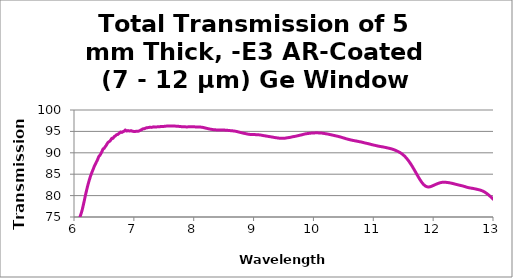
| Category | Transmission (%) |
|---|---|
| 1.66628 | 0.658 |
| 1.6743299999999999 | 0.65 |
| 1.6823800000000002 | 0.646 |
| 1.69043 | 0.589 |
| 1.69848 | 0.588 |
| 1.7065299999999999 | 0.595 |
| 1.71458 | 0.579 |
| 1.72263 | 0.606 |
| 1.73068 | 0.609 |
| 1.73873 | 0.575 |
| 1.74678 | 0.505 |
| 1.75483 | 0.498 |
| 1.76288 | 0.537 |
| 1.7709300000000001 | 0.599 |
| 1.77898 | 0.761 |
| 1.78703 | 1.16 |
| 1.79508 | 1.996 |
| 1.8031199999999998 | 3.977 |
| 1.8111700000000002 | 6.055 |
| 1.81922 | 8.681 |
| 1.82727 | 11.94 |
| 1.8353199999999998 | 15.665 |
| 1.84337 | 19.622 |
| 1.85142 | 23.466 |
| 1.85947 | 26.837 |
| 1.86752 | 30.071 |
| 1.87557 | 33.018 |
| 1.8836199999999999 | 35.954 |
| 1.89167 | 38.478 |
| 1.89972 | 40.631 |
| 1.90777 | 42.293 |
| 1.9158199999999999 | 44.439 |
| 1.92387 | 46.936 |
| 1.93192 | 49.769 |
| 1.93997 | 53.137 |
| 1.94802 | 57.067 |
| 1.95607 | 62.382 |
| 1.9641199999999999 | 65.169 |
| 1.97217 | 67.321 |
| 1.98022 | 69.548 |
| 1.98827 | 71.518 |
| 1.9963199999999999 | 73.368 |
| 2.0043699999999998 | 75.114 |
| 2.01242 | 76.716 |
| 2.02047 | 78.049 |
| 2.02852 | 79.151 |
| 2.0365699999999998 | 79.884 |
| 2.04461 | 80.293 |
| 2.05266 | 80.37 |
| 2.06071 | 80.096 |
| 2.06876 | 79.518 |
| 2.07681 | 78.684 |
| 2.08486 | 77.671 |
| 2.09291 | 76.513 |
| 2.10096 | 75.215 |
| 2.10901 | 73.944 |
| 2.11706 | 72.727 |
| 2.1251100000000003 | 71.654 |
| 2.1331599999999997 | 70.663 |
| 2.14121 | 69.829 |
| 2.1492600000000004 | 69.18 |
| 2.15731 | 68.738 |
| 2.16536 | 68.475 |
| 2.17341 | 68.414 |
| 2.18146 | 68.583 |
| 2.1895100000000003 | 68.929 |
| 2.1975599999999997 | 69.496 |
| 2.20561 | 70.258 |
| 2.21366 | 71.26 |
| 2.22171 | 72.481 |
| 2.22976 | 73.856 |
| 2.23781 | 75.408 |
| 2.24586 | 77.131 |
| 2.25391 | 78.988 |
| 2.26196 | 80.934 |
| 2.27001 | 82.915 |
| 2.27806 | 84.902 |
| 2.2861 | 86.828 |
| 2.29415 | 88.563 |
| 2.3022 | 90.094 |
| 2.31025 | 91.253 |
| 2.3183000000000002 | 92.045 |
| 2.3263499999999997 | 92.364 |
| 2.3344 | 92.126 |
| 2.34245 | 91.33 |
| 2.3505 | 89.987 |
| 2.35855 | 88.146 |
| 2.3666 | 85.846 |
| 2.37465 | 83.124 |
| 2.3827 | 80.14 |
| 2.39075 | 76.886 |
| 2.3988 | 73.564 |
| 2.40685 | 70.169 |
| 2.4149000000000003 | 66.825 |
| 2.4229499999999997 | 63.512 |
| 2.431 | 60.345 |
| 2.4390500000000004 | 57.309 |
| 2.4471 | 54.477 |
| 2.45515 | 51.805 |
| 2.4631999999999996 | 49.302 |
| 2.47125 | 47.005 |
| 2.4793000000000003 | 44.836 |
| 2.4873499999999997 | 42.894 |
| 2.4954 | 41.102 |
| 2.50345 | 39.467 |
| 2.5115 | 37.927 |
| 2.51955 | 36.567 |
| 2.52759 | 35.356 |
| 2.53564 | 34.273 |
| 2.5436900000000002 | 33.28 |
| 2.5517399999999997 | 32.388 |
| 2.55979 | 31.689 |
| 2.5678400000000003 | 30.796 |
| 2.57589 | 30.195 |
| 2.58394 | 29.778 |
| 2.5919899999999996 | 29.205 |
| 2.60004 | 28.619 |
| 2.6080900000000002 | 28.308 |
| 2.6161399999999997 | 28.233 |
| 2.62419 | 27.74 |
| 2.63224 | 27.703 |
| 2.64029 | 27.488 |
| 2.64834 | 27.345 |
| 2.65639 | 27.394 |
| 2.66444 | 27.706 |
| 2.67249 | 27.529 |
| 2.68054 | 27.548 |
| 2.68859 | 27.738 |
| 2.69664 | 27.957 |
| 2.7046900000000003 | 28.108 |
| 2.7127399999999997 | 28.271 |
| 2.72079 | 28.958 |
| 2.72884 | 28.891 |
| 2.73689 | 29.344 |
| 2.74494 | 29.513 |
| 2.7529899999999996 | 29.973 |
| 2.76104 | 30.071 |
| 2.7690799999999998 | 30.322 |
| 2.77713 | 30.382 |
| 2.78518 | 30.59 |
| 2.79323 | 30.683 |
| 2.80128 | 31.109 |
| 2.80933 | 31.248 |
| 2.81738 | 31.672 |
| 2.82543 | 32.006 |
| 2.83348 | 32.647 |
| 2.84153 | 33.092 |
| 2.84958 | 33.749 |
| 2.85763 | 34.327 |
| 2.86568 | 35.088 |
| 2.87373 | 35.856 |
| 2.88178 | 36.666 |
| 2.88983 | 37.544 |
| 2.8978800000000002 | 38.526 |
| 2.9059299999999997 | 39.461 |
| 2.91398 | 40.37 |
| 2.9220300000000003 | 41.501 |
| 2.93008 | 42.518 |
| 2.93813 | 43.617 |
| 2.94618 | 44.714 |
| 2.95423 | 45.944 |
| 2.9622800000000002 | 47.108 |
| 2.97033 | 48.25 |
| 2.97838 | 49.477 |
| 2.98643 | 50.64 |
| 2.99448 | 51.769 |
| 3.00252 | 52.893 |
| 3.01057 | 53.906 |
| 3.01862 | 54.88 |
| 3.02667 | 55.681 |
| 3.0347199999999996 | 56.483 |
| 3.04277 | 57.182 |
| 3.0508200000000003 | 57.784 |
| 3.0588699999999998 | 58.205 |
| 3.06692 | 58.664 |
| 3.07497 | 58.983 |
| 3.08302 | 59.234 |
| 3.09107 | 59.47 |
| 3.09912 | 59.665 |
| 3.10717 | 59.808 |
| 3.11522 | 59.896 |
| 3.1232699999999998 | 59.915 |
| 3.13132 | 59.898 |
| 3.13937 | 59.812 |
| 3.14742 | 59.691 |
| 3.1554699999999998 | 59.538 |
| 3.16352 | 59.362 |
| 3.17157 | 59.11 |
| 3.17962 | 58.896 |
| 3.1876700000000002 | 58.624 |
| 3.1957199999999997 | 58.375 |
| 3.20377 | 58.076 |
| 3.2118200000000003 | 57.737 |
| 3.21987 | 57.438 |
| 3.22792 | 57.137 |
| 3.23597 | 56.825 |
| 3.2440100000000003 | 56.518 |
| 3.2520599999999997 | 56.23 |
| 3.26011 | 55.989 |
| 3.26816 | 55.747 |
| 3.27621 | 55.492 |
| 3.28426 | 55.253 |
| 3.29231 | 55.057 |
| 3.30036 | 54.882 |
| 3.30841 | 54.745 |
| 3.31646 | 54.61 |
| 3.32451 | 54.527 |
| 3.33256 | 54.48 |
| 3.3406100000000003 | 54.414 |
| 3.3486599999999997 | 54.368 |
| 3.35671 | 54.334 |
| 3.3647600000000004 | 54.426 |
| 3.37281 | 54.529 |
| 3.38086 | 54.624 |
| 3.3889099999999996 | 54.739 |
| 3.39696 | 54.85 |
| 3.4050100000000003 | 55.043 |
| 3.4130599999999998 | 55.233 |
| 3.42111 | 55.479 |
| 3.42916 | 55.738 |
| 3.43721 | 56.039 |
| 3.44526 | 56.364 |
| 3.45331 | 56.681 |
| 3.46136 | 57.033 |
| 3.46941 | 57.389 |
| 3.47746 | 57.744 |
| 3.4855 | 58.14 |
| 3.4935500000000004 | 58.573 |
| 3.5016 | 59.01 |
| 3.50965 | 59.484 |
| 3.5176999999999996 | 59.995 |
| 3.52575 | 60.501 |
| 3.5338000000000003 | 61.047 |
| 3.5418499999999997 | 61.591 |
| 3.5499 | 62.133 |
| 3.55795 | 62.682 |
| 3.566 | 63.255 |
| 3.57405 | 63.832 |
| 3.5821 | 64.431 |
| 3.59015 | 65.041 |
| 3.5982 | 65.667 |
| 3.60625 | 66.271 |
| 3.6143 | 66.888 |
| 3.62235 | 67.497 |
| 3.6304000000000003 | 68.078 |
| 3.6384499999999997 | 68.634 |
| 3.6465 | 69.203 |
| 3.65455 | 69.758 |
| 3.6626 | 70.3 |
| 3.67065 | 70.819 |
| 3.6786999999999996 | 71.322 |
| 3.68675 | 71.817 |
| 3.6948000000000003 | 72.288 |
| 3.7028499999999998 | 72.722 |
| 3.7109 | 73.115 |
| 3.71895 | 73.472 |
| 3.72699 | 73.79 |
| 3.73504 | 74.048 |
| 3.74309 | 74.282 |
| 3.75114 | 74.488 |
| 3.7591900000000003 | 74.64 |
| 3.7672399999999997 | 74.749 |
| 3.77529 | 74.828 |
| 3.78334 | 74.862 |
| 3.79139 | 74.852 |
| 3.79944 | 74.792 |
| 3.8074899999999996 | 74.688 |
| 3.81554 | 74.522 |
| 3.8235900000000003 | 74.32 |
| 3.8316399999999997 | 74.062 |
| 3.83969 | 73.757 |
| 3.84774 | 73.413 |
| 3.85579 | 73.025 |
| 3.86384 | 72.616 |
| 3.87189 | 72.178 |
| 3.87994 | 71.695 |
| 3.88799 | 71.183 |
| 3.89604 | 70.653 |
| 3.90409 | 70.092 |
| 3.91214 | 69.495 |
| 3.92019 | 68.878 |
| 3.9282399999999997 | 68.227 |
| 3.93629 | 67.55 |
| 3.94434 | 66.852 |
| 3.95239 | 66.143 |
| 3.96044 | 65.422 |
| 3.96848 | 64.698 |
| 3.9765300000000003 | 63.971 |
| 3.98458 | 63.242 |
| 3.99263 | 62.513 |
| 4.00068 | 61.783 |
| 4.00873 | 61.05 |
| 4.01678 | 60.32 |
| 4.02483 | 59.579 |
| 4.0328800000000005 | 58.848 |
| 4.0409299999999995 | 58.119 |
| 4.04898 | 57.382 |
| 4.05703 | 56.65 |
| 4.06508 | 55.924 |
| 4.07313 | 55.201 |
| 4.08118 | 54.494 |
| 4.08923 | 53.797 |
| 4.09728 | 53.119 |
| 4.10533 | 52.463 |
| 4.11338 | 51.814 |
| 4.12143 | 51.181 |
| 4.129479999999999 | 50.56 |
| 4.13753 | 49.956 |
| 4.14558 | 49.361 |
| 4.15363 | 48.766 |
| 4.1616800000000005 | 48.19 |
| 4.1697299999999995 | 47.624 |
| 4.177779999999999 | 47.074 |
| 4.18583 | 46.538 |
| 4.19388 | 46.056 |
| 4.20192 | 45.62 |
| 4.20997 | 45.192 |
| 4.21802 | 44.771 |
| 4.22607 | 44.401 |
| 4.23412 | 43.969 |
| 4.24217 | 43.413 |
| 4.2502200000000006 | 42.786 |
| 4.25827 | 42.394 |
| 4.2663199999999994 | 42.126 |
| 4.27437 | 41.673 |
| 4.28242 | 41.292 |
| 4.29047 | 40.922 |
| 4.298520000000001 | 40.501 |
| 4.30657 | 40.106 |
| 4.31462 | 39.731 |
| 4.3226700000000005 | 39.384 |
| 4.33072 | 39.035 |
| 4.33877 | 38.707 |
| 4.34682 | 38.402 |
| 4.35487 | 38.106 |
| 4.36292 | 37.824 |
| 4.370970000000001 | 37.56 |
| 4.379020000000001 | 37.312 |
| 4.38707 | 37.079 |
| 4.3951199999999995 | 36.849 |
| 4.40317 | 36.626 |
| 4.41122 | 36.417 |
| 4.41927 | 36.209 |
| 4.42732 | 36.008 |
| 4.43537 | 35.815 |
| 4.44341 | 35.625 |
| 4.45146 | 35.444 |
| 4.45951 | 35.267 |
| 4.467560000000001 | 35.092 |
| 4.47561 | 34.932 |
| 4.4836599999999995 | 34.782 |
| 4.49171 | 34.635 |
| 4.49976 | 34.495 |
| 4.50781 | 34.365 |
| 4.51586 | 34.242 |
| 4.52391 | 34.13 |
| 4.53196 | 34.03 |
| 4.5400100000000005 | 33.937 |
| 4.54806 | 33.853 |
| 4.556109999999999 | 33.774 |
| 4.56416 | 33.696 |
| 4.57221 | 33.622 |
| 4.58026 | 33.559 |
| 4.588310000000001 | 33.495 |
| 4.59636 | 33.436 |
| 4.60441 | 33.381 |
| 4.6124600000000004 | 33.331 |
| 4.62051 | 33.286 |
| 4.62856 | 33.246 |
| 4.636609999999999 | 33.21 |
| 4.64466 | 33.177 |
| 4.65271 | 33.149 |
| 4.66076 | 33.131 |
| 4.668810000000001 | 33.12 |
| 4.67686 | 33.117 |
| 4.6849 | 33.12 |
| 4.69295 | 33.127 |
| 4.701 | 33.141 |
| 4.70905 | 33.16 |
| 4.7171 | 33.185 |
| 4.725149999999999 | 33.218 |
| 4.7332 | 33.251 |
| 4.74125 | 33.284 |
| 4.7493 | 33.326 |
| 4.757350000000001 | 33.371 |
| 4.7654 | 33.415 |
| 4.7734499999999995 | 33.464 |
| 4.7815 | 33.516 |
| 4.78955 | 33.571 |
| 4.7976 | 33.63 |
| 4.80565 | 33.693 |
| 4.8137 | 33.76 |
| 4.82175 | 33.835 |
| 4.8298000000000005 | 33.912 |
| 4.83785 | 33.994 |
| 4.845899999999999 | 34.078 |
| 4.85395 | 34.171 |
| 4.862 | 34.269 |
| 4.87005 | 34.374 |
| 4.878100000000001 | 34.486 |
| 4.88615 | 34.601 |
| 4.8942 | 34.717 |
| 4.90225 | 34.835 |
| 4.9103 | 34.961 |
| 4.91835 | 35.086 |
| 4.9263900000000005 | 35.211 |
| 4.9344399999999995 | 35.345 |
| 4.942489999999999 | 35.49 |
| 4.95054 | 35.632 |
| 4.95859 | 35.767 |
| 4.96664 | 35.906 |
| 4.97469 | 36.057 |
| 4.98274 | 36.208 |
| 4.99079 | 36.357 |
| 4.99884 | 36.516 |
| 5.00689 | 36.676 |
| 5.014939999999999 | 36.844 |
| 5.02299 | 37.005 |
| 5.03104 | 37.17 |
| 5.03909 | 37.351 |
| 5.047140000000001 | 37.536 |
| 5.05519 | 37.724 |
| 5.0632399999999995 | 37.919 |
| 5.07129 | 38.121 |
| 5.07934 | 38.327 |
| 5.08739 | 38.522 |
| 5.09544 | 38.728 |
| 5.10349 | 38.948 |
| 5.11154 | 39.163 |
| 5.1195900000000005 | 39.382 |
| 5.12764 | 39.608 |
| 5.135689999999999 | 39.839 |
| 5.14374 | 40.067 |
| 5.15179 | 40.282 |
| 5.15984 | 40.506 |
| 5.16788 | 40.749 |
| 5.17593 | 40.988 |
| 5.183979999999999 | 41.226 |
| 5.19203 | 41.474 |
| 5.20008 | 41.727 |
| 5.20813 | 41.974 |
| 5.2161800000000005 | 42.223 |
| 5.2242299999999995 | 42.476 |
| 5.232279999999999 | 42.746 |
| 5.24033 | 43.01 |
| 5.24838 | 43.274 |
| 5.25643 | 43.556 |
| 5.26448 | 43.841 |
| 5.27253 | 44.13 |
| 5.28058 | 44.42 |
| 5.28863 | 44.711 |
| 5.29668 | 45.003 |
| 5.304729999999999 | 45.299 |
| 5.31278 | 45.601 |
| 5.32083 | 45.904 |
| 5.32888 | 46.211 |
| 5.336930000000001 | 46.524 |
| 5.34498 | 46.851 |
| 5.3530299999999995 | 47.161 |
| 5.36108 | 47.446 |
| 5.36913 | 47.759 |
| 5.37718 | 48.085 |
| 5.38523 | 48.406 |
| 5.39328 | 48.729 |
| 5.40133 | 49.055 |
| 5.40937 | 49.39 |
| 5.41742 | 49.731 |
| 5.425470000000001 | 50.049 |
| 5.433520000000001 | 50.362 |
| 5.44157 | 50.705 |
| 5.4496199999999995 | 51.055 |
| 5.45767 | 51.41 |
| 5.46572 | 51.768 |
| 5.47377 | 52.107 |
| 5.48182 | 52.452 |
| 5.48987 | 52.807 |
| 5.49792 | 53.176 |
| 5.5059700000000005 | 53.548 |
| 5.51402 | 53.916 |
| 5.522069999999999 | 54.286 |
| 5.53012 | 54.646 |
| 5.53817 | 55.014 |
| 5.54622 | 55.404 |
| 5.554270000000001 | 55.79 |
| 5.56232 | 56.157 |
| 5.57037 | 56.53 |
| 5.57842 | 56.914 |
| 5.58647 | 57.276 |
| 5.59452 | 57.641 |
| 5.60257 | 58.032 |
| 5.61062 | 58.417 |
| 5.61867 | 58.793 |
| 5.626720000000001 | 59.169 |
| 5.6347700000000005 | 59.564 |
| 5.642810000000001 | 59.969 |
| 5.65086 | 60.324 |
| 5.65891 | 60.676 |
| 5.66696 | 61.052 |
| 5.67501 | 61.446 |
| 5.68306 | 61.824 |
| 5.69111 | 62.197 |
| 5.69916 | 62.582 |
| 5.70721 | 62.988 |
| 5.71526 | 63.397 |
| 5.723310000000001 | 63.759 |
| 5.73136 | 64.116 |
| 5.7394099999999995 | 64.494 |
| 5.74746 | 64.874 |
| 5.75551 | 65.253 |
| 5.76356 | 65.654 |
| 5.77161 | 66.026 |
| 5.77966 | 66.346 |
| 5.78771 | 66.689 |
| 5.7957600000000005 | 67.055 |
| 5.80381 | 67.421 |
| 5.811859999999999 | 67.795 |
| 5.81991 | 68.195 |
| 5.82796 | 68.506 |
| 5.83601 | 68.741 |
| 5.844060000000001 | 69.026 |
| 5.85211 | 69.35 |
| 5.86016 | 69.664 |
| 5.86821 | 69.946 |
| 5.87626 | 70.238 |
| 5.8843000000000005 | 70.538 |
| 5.89235 | 70.771 |
| 5.900399999999999 | 70.97 |
| 5.90845 | 71.219 |
| 5.9165 | 71.515 |
| 5.92455 | 71.823 |
| 5.932600000000001 | 72.114 |
| 5.94065 | 72.277 |
| 5.9487 | 72.37 |
| 5.95675 | 72.542 |
| 5.9648 | 72.738 |
| 5.97285 | 72.897 |
| 5.980899999999999 | 73.031 |
| 5.98895 | 73.113 |
| 5.997 | 73.144 |
| 6.00505 | 73.227 |
| 6.0131000000000006 | 73.318 |
| 6.02115 | 73.369 |
| 6.0291999999999994 | 73.463 |
| 6.03725 | 73.644 |
| 6.0453 | 73.811 |
| 6.05335 | 73.861 |
| 6.0614 | 73.962 |
| 6.06945 | 74.15 |
| 6.0775 | 74.309 |
| 6.0855500000000005 | 74.489 |
| 6.0936 | 74.747 |
| 6.101649999999999 | 75.066 |
| 6.1097 | 75.424 |
| 6.11775 | 75.774 |
| 6.12579 | 76.114 |
| 6.13384 | 76.505 |
| 6.14189 | 76.957 |
| 6.14994 | 77.44 |
| 6.15799 | 77.948 |
| 6.16604 | 78.458 |
| 6.1740900000000005 | 78.946 |
| 6.18214 | 79.482 |
| 6.190189999999999 | 80.039 |
| 6.19824 | 80.526 |
| 6.20629 | 80.99 |
| 6.21434 | 81.471 |
| 6.222390000000001 | 81.938 |
| 6.23044 | 82.377 |
| 6.23849 | 82.798 |
| 6.2465399999999995 | 83.201 |
| 6.25459 | 83.585 |
| 6.26264 | 83.958 |
| 6.270689999999999 | 84.315 |
| 6.27874 | 84.649 |
| 6.28679 | 84.965 |
| 6.29484 | 85.268 |
| 6.3028900000000005 | 85.558 |
| 6.3109399999999996 | 85.837 |
| 6.318989999999999 | 86.112 |
| 6.32704 | 86.395 |
| 6.33509 | 86.691 |
| 6.34314 | 86.961 |
| 6.35119 | 87.184 |
| 6.35924 | 87.408 |
| 6.36728 | 87.658 |
| 6.37533 | 87.89 |
| 6.38338 | 88.103 |
| 6.391430000000001 | 88.335 |
| 6.39948 | 88.604 |
| 6.4075299999999995 | 88.904 |
| 6.41558 | 89.144 |
| 6.42363 | 89.263 |
| 6.43168 | 89.398 |
| 6.43973 | 89.581 |
| 6.44778 | 89.776 |
| 6.45583 | 89.978 |
| 6.4638800000000005 | 90.204 |
| 6.47193 | 90.466 |
| 6.479979999999999 | 90.746 |
| 6.48803 | 90.93 |
| 6.49608 | 90.967 |
| 6.50413 | 91.05 |
| 6.51218 | 91.221 |
| 6.52023 | 91.397 |
| 6.52828 | 91.542 |
| 6.5363299999999995 | 91.703 |
| 6.54438 | 91.895 |
| 6.55243 | 92.088 |
| 6.560479999999999 | 92.262 |
| 6.56853 | 92.408 |
| 6.57658 | 92.514 |
| 6.58463 | 92.594 |
| 6.5926800000000005 | 92.67 |
| 6.6007299999999995 | 92.758 |
| 6.608770000000001 | 92.886 |
| 6.61682 | 93.068 |
| 6.62487 | 93.27 |
| 6.63292 | 93.39 |
| 6.64097 | 93.356 |
| 6.64902 | 93.366 |
| 6.65707 | 93.497 |
| 6.66512 | 93.667 |
| 6.67317 | 93.797 |
| 6.681220000000001 | 93.85 |
| 6.6892700000000005 | 93.905 |
| 6.6973199999999995 | 94.022 |
| 6.70537 | 94.162 |
| 6.71342 | 94.241 |
| 6.72147 | 94.257 |
| 6.729520000000001 | 94.284 |
| 6.73757 | 94.359 |
| 6.74562 | 94.455 |
| 6.7536700000000005 | 94.55 |
| 6.76172 | 94.646 |
| 6.76977 | 94.754 |
| 6.777819999999999 | 94.852 |
| 6.78587 | 94.853 |
| 6.79392 | 94.78 |
| 6.80197 | 94.767 |
| 6.810020000000001 | 94.837 |
| 6.81807 | 94.929 |
| 6.8261199999999995 | 94.988 |
| 6.83417 | 95.022 |
| 6.84222 | 95.099 |
| 6.8502600000000005 | 95.245 |
| 6.85831 | 95.336 |
| 6.866359999999999 | 95.213 |
| 6.87441 | 95.096 |
| 6.88246 | 95.08 |
| 6.89051 | 95.131 |
| 6.898560000000001 | 95.178 |
| 6.90661 | 95.18 |
| 6.91466 | 95.136 |
| 6.92271 | 95.094 |
| 6.93076 | 95.086 |
| 6.93881 | 95.11 |
| 6.94686 | 95.151 |
| 6.95491 | 95.169 |
| 6.96296 | 95.135 |
| 6.971010000000001 | 95.063 |
| 6.9790600000000005 | 95.024 |
| 6.9871099999999995 | 95.015 |
| 6.99516 | 94.994 |
| 7.00321 | 94.975 |
| 7.01126 | 94.97 |
| 7.019310000000001 | 94.979 |
| 7.02736 | 94.998 |
| 7.03541 | 95.029 |
| 7.04346 | 95.046 |
| 7.05151 | 95.027 |
| 7.05956 | 95.008 |
| 7.067609999999999 | 95.013 |
| 7.07566 | 95.046 |
| 7.083699999999999 | 95.088 |
| 7.09175 | 95.133 |
| 7.0998 | 95.189 |
| 7.10785 | 95.249 |
| 7.1159 | 95.306 |
| 7.12395 | 95.36 |
| 7.132 | 95.425 |
| 7.1400500000000005 | 95.503 |
| 7.1481 | 95.569 |
| 7.156149999999999 | 95.61 |
| 7.1642 | 95.624 |
| 7.17225 | 95.621 |
| 7.1803 | 95.648 |
| 7.188350000000001 | 95.708 |
| 7.1964 | 95.774 |
| 7.20445 | 95.825 |
| 7.2125 | 95.844 |
| 7.22055 | 95.846 |
| 7.2286 | 95.863 |
| 7.23665 | 95.884 |
| 7.2447 | 95.906 |
| 7.25275 | 95.926 |
| 7.260800000000001 | 95.95 |
| 7.2688500000000005 | 95.963 |
| 7.2768999999999995 | 95.958 |
| 7.28495 | 95.942 |
| 7.293 | 95.936 |
| 7.30105 | 95.957 |
| 7.3091 | 95.984 |
| 7.31715 | 96.017 |
| 7.325189999999999 | 96.049 |
| 7.33324 | 96.064 |
| 7.34129 | 96.043 |
| 7.34934 | 96.018 |
| 7.3573900000000005 | 96.003 |
| 7.3654399999999995 | 96.014 |
| 7.373489999999999 | 96.036 |
| 7.38154 | 96.05 |
| 7.38959 | 96.06 |
| 7.39764 | 96.065 |
| 7.40569 | 96.068 |
| 7.41374 | 96.068 |
| 7.42179 | 96.07 |
| 7.42984 | 96.078 |
| 7.43789 | 96.102 |
| 7.445939999999999 | 96.136 |
| 7.45399 | 96.163 |
| 7.46204 | 96.175 |
| 7.47009 | 96.154 |
| 7.478140000000001 | 96.135 |
| 7.48619 | 96.128 |
| 7.49424 | 96.139 |
| 7.50229 | 96.162 |
| 7.51034 | 96.182 |
| 7.51839 | 96.199 |
| 7.52644 | 96.212 |
| 7.53449 | 96.222 |
| 7.54254 | 96.234 |
| 7.550590000000001 | 96.248 |
| 7.5586400000000005 | 96.264 |
| 7.56668 | 96.276 |
| 7.57473 | 96.28 |
| 7.58278 | 96.278 |
| 7.5908299999999995 | 96.271 |
| 7.59888 | 96.267 |
| 7.60693 | 96.265 |
| 7.614979999999999 | 96.263 |
| 7.62303 | 96.26 |
| 7.63108 | 96.259 |
| 7.63913 | 96.259 |
| 7.6471800000000005 | 96.26 |
| 7.6552299999999995 | 96.259 |
| 7.663279999999999 | 96.256 |
| 7.67133 | 96.252 |
| 7.67938 | 96.247 |
| 7.68743 | 96.241 |
| 7.69548 | 96.234 |
| 7.70353 | 96.224 |
| 7.71158 | 96.213 |
| 7.71963 | 96.202 |
| 7.72768 | 96.194 |
| 7.735729999999999 | 96.188 |
| 7.74378 | 96.181 |
| 7.75183 | 96.173 |
| 7.75988 | 96.16 |
| 7.767930000000001 | 96.147 |
| 7.77598 | 96.134 |
| 7.78403 | 96.123 |
| 7.79208 | 96.113 |
| 7.80013 | 96.103 |
| 7.8081700000000005 | 96.092 |
| 7.81622 | 96.081 |
| 7.82427 | 96.072 |
| 7.832319999999999 | 96.067 |
| 7.84037 | 96.067 |
| 7.84842 | 96.066 |
| 7.85647 | 96.065 |
| 7.864520000000001 | 96.058 |
| 7.87257 | 96.052 |
| 7.8806199999999995 | 96.047 |
| 7.88867 | 96.048 |
| 7.89672 | 96.053 |
| 7.90477 | 96.062 |
| 7.91282 | 96.073 |
| 7.92087 | 96.082 |
| 7.92892 | 96.089 |
| 7.9369700000000005 | 96.09 |
| 7.94502 | 96.09 |
| 7.953069999999999 | 96.09 |
| 7.96112 | 96.09 |
| 7.96917 | 96.09 |
| 7.97722 | 96.09 |
| 7.985270000000001 | 96.087 |
| 7.99332 | 96.082 |
| 8.00137 | 96.074 |
| 8.00942 | 96.066 |
| 8.01747 | 96.059 |
| 8.02552 | 96.054 |
| 8.03357 | 96.052 |
| 8.04162 | 96.051 |
| 8.04966 | 96.051 |
| 8.05771 | 96.05 |
| 8.065760000000001 | 96.049 |
| 8.07381 | 96.046 |
| 8.081859999999999 | 96.042 |
| 8.08991 | 96.036 |
| 8.09796 | 96.028 |
| 8.10601 | 96.018 |
| 8.11406 | 96.008 |
| 8.12211 | 95.996 |
| 8.13016 | 95.982 |
| 8.13821 | 95.966 |
| 8.14626 | 95.947 |
| 8.15431 | 95.926 |
| 8.16236 | 95.902 |
| 8.17041 | 95.875 |
| 8.17846 | 95.847 |
| 8.18651 | 95.819 |
| 8.19456 | 95.79 |
| 8.20261 | 95.762 |
| 8.21066 | 95.736 |
| 8.21871 | 95.709 |
| 8.22676 | 95.684 |
| 8.23481 | 95.658 |
| 8.24286 | 95.631 |
| 8.25091 | 95.604 |
| 8.258959999999998 | 95.578 |
| 8.26701 | 95.555 |
| 8.27506 | 95.532 |
| 8.28311 | 95.512 |
| 8.29115 | 95.491 |
| 8.2992 | 95.471 |
| 8.30725 | 95.451 |
| 8.315299999999999 | 95.434 |
| 8.32335 | 95.419 |
| 8.3314 | 95.407 |
| 8.339450000000001 | 95.396 |
| 8.3475 | 95.385 |
| 8.35555 | 95.374 |
| 8.3636 | 95.364 |
| 8.371649999999999 | 95.357 |
| 8.379700000000001 | 95.351 |
| 8.38775 | 95.346 |
| 8.3958 | 95.34 |
| 8.40385 | 95.335 |
| 8.4119 | 95.331 |
| 8.41995 | 95.328 |
| 8.428 | 95.327 |
| 8.43605 | 95.327 |
| 8.4441 | 95.328 |
| 8.45215 | 95.328 |
| 8.4602 | 95.328 |
| 8.46825 | 95.326 |
| 8.476299999999998 | 95.324 |
| 8.484350000000001 | 95.321 |
| 8.4924 | 95.317 |
| 8.50045 | 95.312 |
| 8.5085 | 95.306 |
| 8.516549999999999 | 95.3 |
| 8.52459 | 95.294 |
| 8.532639999999999 | 95.287 |
| 8.54069 | 95.281 |
| 8.54874 | 95.272 |
| 8.556790000000001 | 95.263 |
| 8.56484 | 95.251 |
| 8.57289 | 95.239 |
| 8.58094 | 95.226 |
| 8.588989999999999 | 95.213 |
| 8.597040000000002 | 95.2 |
| 8.60509 | 95.188 |
| 8.61314 | 95.177 |
| 8.62119 | 95.168 |
| 8.62924 | 95.158 |
| 8.63729 | 95.148 |
| 8.645340000000001 | 95.137 |
| 8.65339 | 95.124 |
| 8.66144 | 95.11 |
| 8.66949 | 95.094 |
| 8.67754 | 95.079 |
| 8.68559 | 95.064 |
| 8.69364 | 95.046 |
| 8.701690000000001 | 95.028 |
| 8.70974 | 95.004 |
| 8.71779 | 94.979 |
| 8.72584 | 94.949 |
| 8.733889999999999 | 94.919 |
| 8.741940000000001 | 94.888 |
| 8.74999 | 94.858 |
| 8.758040000000001 | 94.829 |
| 8.76608 | 94.802 |
| 8.77413 | 94.775 |
| 8.78218 | 94.748 |
| 8.79023 | 94.722 |
| 8.79828 | 94.694 |
| 8.806329999999999 | 94.666 |
| 8.81438 | 94.639 |
| 8.82243 | 94.612 |
| 8.83048 | 94.586 |
| 8.83853 | 94.561 |
| 8.84658 | 94.538 |
| 8.854629999999998 | 94.515 |
| 8.862680000000001 | 94.492 |
| 8.87073 | 94.467 |
| 8.87878 | 94.441 |
| 8.88683 | 94.414 |
| 8.894879999999999 | 94.388 |
| 8.90293 | 94.367 |
| 8.91098 | 94.347 |
| 8.919030000000001 | 94.332 |
| 8.92708 | 94.318 |
| 8.93513 | 94.305 |
| 8.94318 | 94.292 |
| 8.951229999999999 | 94.28 |
| 8.959280000000001 | 94.27 |
| 8.96733 | 94.262 |
| 8.97538 | 94.257 |
| 8.98343 | 94.256 |
| 8.99148 | 94.256 |
| 8.99953 | 94.258 |
| 9.00757 | 94.258 |
| 9.01562 | 94.257 |
| 9.02367 | 94.251 |
| 9.03172 | 94.244 |
| 9.03977 | 94.234 |
| 9.04782 | 94.224 |
| 9.05587 | 94.215 |
| 9.06392 | 94.206 |
| 9.071969999999999 | 94.202 |
| 9.080020000000001 | 94.198 |
| 9.08807 | 94.192 |
| 9.09612 | 94.186 |
| 9.10417 | 94.174 |
| 9.112219999999999 | 94.161 |
| 9.12027 | 94.142 |
| 9.12832 | 94.121 |
| 9.136370000000001 | 94.098 |
| 9.14442 | 94.074 |
| 9.15247 | 94.053 |
| 9.16052 | 94.032 |
| 9.168569999999999 | 94.013 |
| 9.176620000000002 | 93.995 |
| 9.18467 | 93.977 |
| 9.19272 | 93.96 |
| 9.20077 | 93.94 |
| 9.20882 | 93.921 |
| 9.21687 | 93.9 |
| 9.224920000000001 | 93.88 |
| 9.23297 | 93.859 |
| 9.24102 | 93.839 |
| 9.24906 | 93.82 |
| 9.25711 | 93.801 |
| 9.26516 | 93.783 |
| 9.273209999999999 | 93.765 |
| 9.28126 | 93.746 |
| 9.289309999999999 | 93.728 |
| 9.297360000000001 | 93.71 |
| 9.30541 | 93.691 |
| 9.31346 | 93.672 |
| 9.32151 | 93.651 |
| 9.329559999999999 | 93.63 |
| 9.33761 | 93.608 |
| 9.34566 | 93.588 |
| 9.35371 | 93.568 |
| 9.36176 | 93.55 |
| 9.36981 | 93.534 |
| 9.37786 | 93.518 |
| 9.385909999999999 | 93.501 |
| 9.39396 | 93.484 |
| 9.40201 | 93.467 |
| 9.41006 | 93.45 |
| 9.41811 | 93.436 |
| 9.42616 | 93.423 |
| 9.434209999999998 | 93.413 |
| 9.442260000000001 | 93.405 |
| 9.45031 | 93.397 |
| 9.45836 | 93.39 |
| 9.46641 | 93.384 |
| 9.474459999999999 | 93.378 |
| 9.48251 | 93.374 |
| 9.490549999999999 | 93.373 |
| 9.4986 | 93.374 |
| 9.50665 | 93.382 |
| 9.514700000000001 | 93.391 |
| 9.52275 | 93.409 |
| 9.5308 | 93.427 |
| 9.53885 | 93.448 |
| 9.546899999999999 | 93.47 |
| 9.554950000000002 | 93.49 |
| 9.563 | 93.508 |
| 9.57105 | 93.524 |
| 9.5791 | 93.538 |
| 9.58715 | 93.552 |
| 9.5952 | 93.569 |
| 9.60325 | 93.586 |
| 9.6113 | 93.61 |
| 9.61935 | 93.635 |
| 9.6274 | 93.663 |
| 9.63545 | 93.691 |
| 9.6435 | 93.717 |
| 9.651549999999999 | 93.742 |
| 9.659600000000001 | 93.764 |
| 9.66765 | 93.785 |
| 9.6757 | 93.805 |
| 9.68375 | 93.824 |
| 9.691799999999999 | 93.843 |
| 9.69985 | 93.865 |
| 9.7079 | 93.887 |
| 9.715950000000001 | 93.912 |
| 9.724 | 93.938 |
| 9.732040000000001 | 93.965 |
| 9.74009 | 93.993 |
| 9.74814 | 94.021 |
| 9.75619 | 94.048 |
| 9.76424 | 94.074 |
| 9.772290000000002 | 94.099 |
| 9.78034 | 94.124 |
| 9.78839 | 94.149 |
| 9.79644 | 94.173 |
| 9.80449 | 94.199 |
| 9.81254 | 94.228 |
| 9.82059 | 94.257 |
| 9.82864 | 94.29 |
| 9.83669 | 94.322 |
| 9.84474 | 94.352 |
| 9.85279 | 94.38 |
| 9.86084 | 94.405 |
| 9.868889999999999 | 94.424 |
| 9.876940000000001 | 94.444 |
| 9.88499 | 94.459 |
| 9.893040000000001 | 94.475 |
| 9.90109 | 94.491 |
| 9.909139999999999 | 94.508 |
| 9.91719 | 94.526 |
| 9.92524 | 94.542 |
| 9.933290000000001 | 94.559 |
| 9.94134 | 94.571 |
| 9.94939 | 94.583 |
| 9.95744 | 94.594 |
| 9.96548 | 94.603 |
| 9.97353 | 94.612 |
| 9.98158 | 94.621 |
| 9.98963 | 94.63 |
| 9.99768 | 94.638 |
| 10.005700000000001 | 94.645 |
| 10.0138 | 94.651 |
| 10.021799999999999 | 94.654 |
| 10.0299 | 94.657 |
| 10.0379 | 94.657 |
| 10.046 | 94.657 |
| 10.054 | 94.658 |
| 10.062100000000001 | 94.657 |
| 10.0701 | 94.657 |
| 10.0782 | 94.656 |
| 10.086200000000002 | 94.655 |
| 10.094299999999999 | 94.652 |
| 10.1023 | 94.649 |
| 10.1104 | 94.645 |
| 10.1184 | 94.637 |
| 10.1265 | 94.629 |
| 10.1345 | 94.616 |
| 10.1426 | 94.602 |
| 10.1506 | 94.587 |
| 10.158700000000001 | 94.568 |
| 10.1667 | 94.549 |
| 10.1748 | 94.53 |
| 10.182799999999999 | 94.51 |
| 10.1909 | 94.491 |
| 10.1989 | 94.472 |
| 10.207 | 94.453 |
| 10.215 | 94.434 |
| 10.2231 | 94.415 |
| 10.2311 | 94.395 |
| 10.2392 | 94.374 |
| 10.247200000000001 | 94.354 |
| 10.2553 | 94.331 |
| 10.2633 | 94.307 |
| 10.2714 | 94.283 |
| 10.279399999999999 | 94.258 |
| 10.2875 | 94.232 |
| 10.2955 | 94.207 |
| 10.303600000000001 | 94.182 |
| 10.3116 | 94.156 |
| 10.319700000000001 | 94.131 |
| 10.3277 | 94.106 |
| 10.335799999999999 | 94.08 |
| 10.3438 | 94.053 |
| 10.351899999999999 | 94.026 |
| 10.3599 | 94 |
| 10.368 | 93.974 |
| 10.376 | 93.949 |
| 10.3841 | 93.925 |
| 10.392100000000001 | 93.901 |
| 10.4002 | 93.875 |
| 10.4082 | 93.85 |
| 10.4163 | 93.822 |
| 10.424299999999999 | 93.793 |
| 10.4324 | 93.764 |
| 10.4404 | 93.732 |
| 10.4485 | 93.701 |
| 10.4565 | 93.668 |
| 10.4646 | 93.636 |
| 10.4726 | 93.603 |
| 10.4807 | 93.569 |
| 10.488700000000001 | 93.535 |
| 10.496799999999999 | 93.501 |
| 10.5048 | 93.465 |
| 10.5129 | 93.429 |
| 10.5209 | 93.394 |
| 10.529 | 93.358 |
| 10.537 | 93.322 |
| 10.5451 | 93.289 |
| 10.5531 | 93.257 |
| 10.561200000000001 | 93.226 |
| 10.5692 | 93.196 |
| 10.5773 | 93.167 |
| 10.5853 | 93.138 |
| 10.593399999999999 | 93.109 |
| 10.6014 | 93.08 |
| 10.6095 | 93.052 |
| 10.6175 | 93.025 |
| 10.6256 | 92.997 |
| 10.6336 | 92.972 |
| 10.6417 | 92.947 |
| 10.649700000000001 | 92.922 |
| 10.6578 | 92.9 |
| 10.665799999999999 | 92.877 |
| 10.6739 | 92.855 |
| 10.681899999999999 | 92.835 |
| 10.69 | 92.814 |
| 10.698 | 92.794 |
| 10.706100000000001 | 92.774 |
| 10.7141 | 92.754 |
| 10.7222 | 92.731 |
| 10.7302 | 92.708 |
| 10.738299999999999 | 92.686 |
| 10.7463 | 92.663 |
| 10.7544 | 92.639 |
| 10.7624 | 92.618 |
| 10.7705 | 92.597 |
| 10.7785 | 92.576 |
| 10.7866 | 92.555 |
| 10.7946 | 92.533 |
| 10.802700000000002 | 92.512 |
| 10.8107 | 92.484 |
| 10.818700000000002 | 92.457 |
| 10.826799999999999 | 92.428 |
| 10.8348 | 92.397 |
| 10.8429 | 92.366 |
| 10.8509 | 92.336 |
| 10.859 | 92.308 |
| 10.867 | 92.28 |
| 10.8751 | 92.253 |
| 10.8831 | 92.229 |
| 10.891200000000001 | 92.205 |
| 10.8992 | 92.18 |
| 10.9073 | 92.156 |
| 10.915299999999998 | 92.132 |
| 10.923399999999999 | 92.104 |
| 10.9314 | 92.075 |
| 10.9395 | 92.047 |
| 10.9475 | 92.015 |
| 10.9556 | 91.984 |
| 10.9636 | 91.952 |
| 10.9717 | 91.923 |
| 10.979700000000001 | 91.894 |
| 10.9878 | 91.865 |
| 10.9958 | 91.84 |
| 11.0039 | 91.814 |
| 11.011899999999999 | 91.789 |
| 11.02 | 91.764 |
| 11.028 | 91.74 |
| 11.036100000000001 | 91.715 |
| 11.0441 | 91.689 |
| 11.052200000000001 | 91.662 |
| 11.0602 | 91.636 |
| 11.068299999999999 | 91.61 |
| 11.0763 | 91.584 |
| 11.0844 | 91.559 |
| 11.0924 | 91.536 |
| 11.1005 | 91.513 |
| 11.1085 | 91.492 |
| 11.1166 | 91.472 |
| 11.124600000000001 | 91.453 |
| 11.132700000000002 | 91.434 |
| 11.1407 | 91.416 |
| 11.1488 | 91.398 |
| 11.156799999999999 | 91.379 |
| 11.1649 | 91.359 |
| 11.1729 | 91.339 |
| 11.181 | 91.317 |
| 11.189 | 91.295 |
| 11.1971 | 91.272 |
| 11.2051 | 91.247 |
| 11.2132 | 91.222 |
| 11.221200000000001 | 91.196 |
| 11.229299999999999 | 91.169 |
| 11.2373 | 91.142 |
| 11.2454 | 91.115 |
| 11.2534 | 91.089 |
| 11.2615 | 91.062 |
| 11.2695 | 91.036 |
| 11.2776 | 91.009 |
| 11.2856 | 90.981 |
| 11.293700000000001 | 90.953 |
| 11.3017 | 90.922 |
| 11.3098 | 90.889 |
| 11.3178 | 90.856 |
| 11.325899999999999 | 90.819 |
| 11.3339 | 90.779 |
| 11.342 | 90.74 |
| 11.35 | 90.697 |
| 11.3581 | 90.652 |
| 11.366100000000001 | 90.606 |
| 11.3742 | 90.559 |
| 11.382200000000001 | 90.507 |
| 11.3903 | 90.456 |
| 11.398299999999999 | 90.404 |
| 11.4064 | 90.348 |
| 11.414399999999999 | 90.292 |
| 11.4225 | 90.236 |
| 11.4305 | 90.174 |
| 11.438600000000001 | 90.112 |
| 11.4466 | 90.049 |
| 11.4547 | 89.976 |
| 11.4627 | 89.903 |
| 11.470799999999999 | 89.83 |
| 11.4788 | 89.745 |
| 11.4869 | 89.658 |
| 11.4949 | 89.57 |
| 11.503 | 89.472 |
| 11.511 | 89.368 |
| 11.5191 | 89.265 |
| 11.5271 | 89.154 |
| 11.535200000000001 | 89.034 |
| 11.5432 | 88.914 |
| 11.5513 | 88.789 |
| 11.559299999999999 | 88.654 |
| 11.5674 | 88.518 |
| 11.5754 | 88.381 |
| 11.5835 | 88.23 |
| 11.5915 | 88.079 |
| 11.5996 | 87.929 |
| 11.6076 | 87.764 |
| 11.6157 | 87.597 |
| 11.623700000000001 | 87.431 |
| 11.6318 | 87.255 |
| 11.6398 | 87.074 |
| 11.6479 | 86.893 |
| 11.655899999999999 | 86.708 |
| 11.664 | 86.518 |
| 11.672 | 86.328 |
| 11.6801 | 86.138 |
| 11.6881 | 85.942 |
| 11.696200000000001 | 85.747 |
| 11.7042 | 85.552 |
| 11.712299999999999 | 85.354 |
| 11.7203 | 85.156 |
| 11.728399999999999 | 84.958 |
| 11.7364 | 84.762 |
| 11.7445 | 84.566 |
| 11.7525 | 84.37 |
| 11.7606 | 84.178 |
| 11.768600000000001 | 83.992 |
| 11.7767 | 83.806 |
| 11.7847 | 83.621 |
| 11.7928 | 83.455 |
| 11.800799999999999 | 83.29 |
| 11.8089 | 83.125 |
| 11.8169 | 82.979 |
| 11.825 | 82.844 |
| 11.833 | 82.709 |
| 11.8411 | 82.584 |
| 11.8491 | 82.485 |
| 11.8572 | 82.387 |
| 11.865200000000002 | 82.289 |
| 11.873299999999999 | 82.226 |
| 11.8813 | 82.167 |
| 11.8894 | 82.108 |
| 11.8974 | 82.069 |
| 11.9055 | 82.048 |
| 11.9135 | 82.028 |
| 11.9216 | 82.012 |
| 11.9296 | 82.026 |
| 11.937700000000001 | 82.041 |
| 11.9457 | 82.055 |
| 11.9538 | 82.087 |
| 11.961799999999998 | 82.127 |
| 11.969899999999999 | 82.166 |
| 11.9779 | 82.208 |
| 11.986 | 82.258 |
| 11.994 | 82.309 |
| 12.0021 | 82.359 |
| 12.0101 | 82.41 |
| 12.0181 | 82.461 |
| 12.026200000000001 | 82.511 |
| 12.0342 | 82.561 |
| 12.0423 | 82.609 |
| 12.0503 | 82.658 |
| 12.058399999999999 | 82.706 |
| 12.0664 | 82.75 |
| 12.0745 | 82.795 |
| 12.0825 | 82.839 |
| 12.0906 | 82.881 |
| 12.098600000000001 | 82.918 |
| 12.1067 | 82.956 |
| 12.114700000000001 | 82.994 |
| 12.1228 | 83.021 |
| 12.130799999999999 | 83.047 |
| 12.1389 | 83.073 |
| 12.1469 | 83.093 |
| 12.155 | 83.104 |
| 12.163 | 83.115 |
| 12.171100000000001 | 83.126 |
| 12.1791 | 83.125 |
| 12.1872 | 83.123 |
| 12.195200000000002 | 83.12 |
| 12.203299999999999 | 83.115 |
| 12.2113 | 83.103 |
| 12.2194 | 83.092 |
| 12.2274 | 83.08 |
| 12.2355 | 83.067 |
| 12.2435 | 83.052 |
| 12.2516 | 83.036 |
| 12.2596 | 83.021 |
| 12.267700000000001 | 83.002 |
| 12.2757 | 82.984 |
| 12.2838 | 82.965 |
| 12.291799999999999 | 82.943 |
| 12.2999 | 82.918 |
| 12.3079 | 82.893 |
| 12.316 | 82.868 |
| 12.324 | 82.84 |
| 12.3321 | 82.811 |
| 12.3401 | 82.782 |
| 12.3482 | 82.752 |
| 12.356200000000001 | 82.723 |
| 12.3643 | 82.694 |
| 12.3723 | 82.664 |
| 12.3804 | 82.635 |
| 12.388399999999999 | 82.606 |
| 12.3965 | 82.576 |
| 12.4045 | 82.547 |
| 12.412600000000001 | 82.519 |
| 12.4206 | 82.491 |
| 12.428700000000001 | 82.464 |
| 12.4367 | 82.437 |
| 12.444799999999999 | 82.412 |
| 12.4528 | 82.388 |
| 12.460899999999999 | 82.364 |
| 12.4689 | 82.338 |
| 12.477 | 82.312 |
| 12.485 | 82.285 |
| 12.4931 | 82.259 |
| 12.501100000000001 | 82.226 |
| 12.5092 | 82.192 |
| 12.5172 | 82.157 |
| 12.5253 | 82.123 |
| 12.533299999999999 | 82.086 |
| 12.5414 | 82.049 |
| 12.5494 | 82.012 |
| 12.5575 | 81.977 |
| 12.5655 | 81.947 |
| 12.5736 | 81.916 |
| 12.5816 | 81.886 |
| 12.5897 | 81.86 |
| 12.597700000000001 | 81.838 |
| 12.605799999999999 | 81.817 |
| 12.6138 | 81.795 |
| 12.6219 | 81.775 |
| 12.6299 | 81.756 |
| 12.638 | 81.737 |
| 12.646 | 81.718 |
| 12.6541 | 81.698 |
| 12.6621 | 81.678 |
| 12.670200000000001 | 81.657 |
| 12.6782 | 81.636 |
| 12.6863 | 81.613 |
| 12.6943 | 81.59 |
| 12.702399999999999 | 81.566 |
| 12.7104 | 81.543 |
| 12.7185 | 81.518 |
| 12.7265 | 81.492 |
| 12.7346 | 81.467 |
| 12.7426 | 81.442 |
| 12.7507 | 81.414 |
| 12.758700000000001 | 81.386 |
| 12.7668 | 81.358 |
| 12.774799999999999 | 81.328 |
| 12.7829 | 81.293 |
| 12.790899999999999 | 81.259 |
| 12.799 | 81.225 |
| 12.807 | 81.186 |
| 12.815100000000001 | 81.14 |
| 12.8231 | 81.095 |
| 12.8312 | 81.049 |
| 12.8392 | 80.995 |
| 12.847299999999999 | 80.932 |
| 12.8553 | 80.87 |
| 12.8634 | 80.807 |
| 12.8714 | 80.735 |
| 12.8795 | 80.655 |
| 12.8875 | 80.574 |
| 12.8956 | 80.494 |
| 12.9036 | 80.407 |
| 12.911700000000002 | 80.316 |
| 12.9197 | 80.224 |
| 12.9278 | 80.133 |
| 12.935799999999999 | 80.039 |
| 12.9439 | 79.942 |
| 12.9519 | 79.845 |
| 12.96 | 79.749 |
| 12.968 | 79.648 |
| 12.9761 | 79.544 |
| 12.9841 | 79.44 |
| 12.9922 | 79.337 |
| 13.000200000000001 | 79.229 |
| 13.008299999999998 | 79.118 |
| 13.0163 | 79.006 |
| 13.0244 | 78.895 |
| 13.032399999999999 | 78.782 |
| 13.0405 | 78.669 |
| 13.0485 | 78.555 |
| 13.0566 | 78.442 |
| 13.0646 | 78.329 |
| 13.072700000000001 | 78.218 |
| 13.0807 | 78.108 |
| 13.088799999999999 | 77.997 |
| 13.0968 | 77.887 |
| 13.104899999999999 | 77.777 |
| 13.1129 | 77.668 |
| 13.121 | 77.559 |
| 13.129 | 77.45 |
| 13.1371 | 77.34 |
| 13.145100000000001 | 77.231 |
| 13.1532 | 77.122 |
| 13.161200000000001 | 77.014 |
| 13.1693 | 76.91 |
| 13.177299999999999 | 76.806 |
| 13.1854 | 76.702 |
| 13.1934 | 76.598 |
| 13.2015 | 76.506 |
| 13.2095 | 76.416 |
| 13.2175 | 76.326 |
| 13.2256 | 76.236 |
| 13.233600000000001 | 76.157 |
| 13.241700000000002 | 76.084 |
| 13.2497 | 76.011 |
| 13.2578 | 75.937 |
| 13.265799999999999 | 75.87 |
| 13.2739 | 75.81 |
| 13.2819 | 75.749 |
| 13.29 | 75.689 |
| 13.298 | 75.63 |
| 13.3061 | 75.579 |
| 13.3141 | 75.527 |
| 13.3222 | 75.475 |
| 13.330200000000001 | 75.424 |
| 13.338299999999998 | 75.382 |
| 13.3463 | 75.341 |
| 13.3544 | 75.299 |
| 13.3624 | 75.258 |
| 13.3705 | 75.226 |
| 13.3785 | 75.198 |
| 13.3866 | 75.17 |
| 13.3946 | 75.142 |
| 13.402700000000001 | 75.121 |
| 13.4107 | 75.108 |
| 13.4188 | 75.096 |
| 13.4268 | 75.083 |
| 13.434899999999999 | 75.072 |
| 13.4429 | 75.07 |
| 13.451 | 75.069 |
| 13.459 | 75.067 |
| 13.4671 | 75.066 |
| 13.475100000000001 | 75.069 |
| 13.4832 | 75.073 |
| 13.491200000000001 | 75.078 |
| 13.4993 | 75.082 |
| 13.507299999999999 | 75.088 |
| 13.5154 | 75.097 |
| 13.523399999999999 | 75.106 |
| 13.5315 | 75.115 |
| 13.5395 | 75.124 |
| 13.547600000000001 | 75.138 |
| 13.5556 | 75.151 |
| 13.5637 | 75.165 |
| 13.5717 | 75.179 |
| 13.579799999999999 | 75.193 |
| 13.5878 | 75.208 |
| 13.5959 | 75.222 |
| 13.6039 | 75.237 |
| 13.612 | 75.251 |
| 13.62 | 75.262 |
| 13.6281 | 75.274 |
| 13.6361 | 75.285 |
| 13.644200000000001 | 75.296 |
| 13.6522 | 75.306 |
| 13.6603 | 75.315 |
| 13.668299999999999 | 75.324 |
| 13.6764 | 75.333 |
| 13.6844 | 75.341 |
| 13.6925 | 75.348 |
| 13.7005 | 75.355 |
| 13.7086 | 75.362 |
| 13.7166 | 75.368 |
| 13.7247 | 75.372 |
| 13.732700000000001 | 75.374 |
| 13.7408 | 75.376 |
| 13.7488 | 75.379 |
| 13.7569 | 75.38 |
| 13.764899999999999 | 75.38 |
| 13.773 | 75.38 |
| 13.781 | 75.38 |
| 13.789100000000001 | 75.379 |
| 13.7971 | 75.38 |
| 13.805200000000001 | 75.381 |
| 13.8132 | 75.381 |
| 13.821299999999999 | 75.382 |
| 13.8293 | 75.382 |
| 13.837399999999999 | 75.38 |
| 13.8454 | 75.378 |
| 13.8535 | 75.376 |
| 13.8615 | 75.374 |
| 13.8696 | 75.366 |
| 13.877600000000001 | 75.353 |
| 13.8857 | 75.34 |
| 13.8937 | 75.328 |
| 13.9018 | 75.315 |
| 13.909799999999999 | 75.294 |
| 13.9179 | 75.272 |
| 13.9259 | 75.25 |
| 13.934 | 75.229 |
| 13.942 | 75.206 |
| 13.9501 | 75.182 |
| 13.9581 | 75.157 |
| 13.9662 | 75.132 |
| 13.974200000000002 | 75.107 |
| 13.982299999999999 | 75.082 |
| 13.9903 | 75.056 |
| 13.9984 | 75.03 |
| 14.0064 | 75.004 |
| 14.0145 | 74.978 |
| 14.0225 | 74.952 |
| 14.0306 | 74.925 |
| 14.0386 | 74.899 |
| 14.046700000000001 | 74.872 |
| 14.0547 | 74.846 |
| 14.0628 | 74.819 |
| 14.070799999999998 | 74.793 |
| 14.078899999999999 | 74.766 |
| 14.0869 | 74.74 |
| 14.095 | 74.712 |
| 14.103 | 74.681 |
| 14.1111 | 74.651 |
| 14.1191 | 74.62 |
| 14.1272 | 74.59 |
| 14.135200000000001 | 74.552 |
| 14.1433 | 74.511 |
| 14.151299999999999 | 74.47 |
| 14.1594 | 74.429 |
| 14.167399999999999 | 74.389 |
| 14.1755 | 74.339 |
| 14.1835 | 74.288 |
| 14.191600000000001 | 74.238 |
| 14.1996 | 74.187 |
| 14.2077 | 74.136 |
| 14.2157 | 74.079 |
| 14.223799999999999 | 74.021 |
| 14.2318 | 73.964 |
| 14.2399 | 73.906 |
| 14.2479 | 73.846 |
| 14.256 | 73.777 |
| 14.264 | 73.708 |
| 14.2721 | 73.64 |
| 14.280100000000001 | 73.571 |
| 14.288200000000002 | 73.495 |
| 14.2962 | 73.409 |
| 14.3043 | 73.322 |
| 14.312299999999999 | 73.236 |
| 14.3204 | 73.15 |
| 14.3284 | 73.056 |
| 14.3365 | 72.955 |
| 14.3445 | 72.854 |
| 14.3526 | 72.753 |
| 14.3606 | 72.652 |
| 14.3687 | 72.546 |
| 14.376700000000001 | 72.436 |
| 14.384799999999998 | 72.325 |
| 14.3928 | 72.215 |
| 14.4009 | 72.105 |
| 14.4089 | 71.987 |
| 14.4169 | 71.865 |
| 14.425 | 71.742 |
| 14.433 | 71.62 |
| 14.4411 | 71.498 |
| 14.4491 | 71.364 |
| 14.4572 | 71.222 |
| 14.465200000000001 | 71.08 |
| 14.4733 | 70.938 |
| 14.4813 | 70.797 |
| 14.4894 | 70.642 |
| 14.497399999999999 | 70.48 |
| 14.5055 | 70.318 |
| 14.5135 | 70.156 |
| 14.521600000000001 | 69.994 |
| 14.5296 | 69.826 |
| 14.537700000000001 | 69.651 |
| 14.5457 | 69.477 |
| 14.553799999999999 | 69.304 |
| 14.5618 | 69.13 |
| 14.5699 | 68.955 |
| 14.5779 | 68.778 |
| 14.586 | 68.601 |
| 14.594 | 68.424 |
| 14.6021 | 68.248 |
| 14.610100000000001 | 68.072 |
| 14.6182 | 67.894 |
| 14.6262 | 67.717 |
| 14.6343 | 67.54 |
| 14.642299999999999 | 67.364 |
| 14.6504 | 67.187 |
| 14.6584 | 67.009 |
| 14.6665 | 66.831 |
| 14.6745 | 66.654 |
| 14.6826 | 66.477 |
| 14.6906 | 66.3 |
| 14.6987 | 66.123 |
| 14.706700000000001 | 65.947 |
| 14.714799999999999 | 65.771 |
| 14.7228 | 65.595 |
| 14.7309 | 65.419 |
| 14.7389 | 65.244 |
| 14.747 | 65.07 |
| 14.755 | 64.896 |
| 14.7631 | 64.721 |
| 14.7711 | 64.548 |
| 14.779200000000001 | 64.376 |
| 14.7872 | 64.206 |
| 14.7953 | 64.036 |
| 14.8033 | 63.866 |
| 14.811399999999999 | 63.696 |
| 14.8194 | 63.533 |
| 14.8275 | 63.378 |
| 14.8355 | 63.223 |
| 14.8436 | 63.069 |
| 14.851600000000001 | 62.914 |
| 14.8597 | 62.763 |
| 14.867700000000001 | 62.622 |
| 14.8758 | 62.481 |
| 14.883799999999999 | 62.34 |
| 14.8919 | 62.2 |
| 14.899899999999999 | 62.06 |
| 14.908 | 61.889 |
| 14.916 | 61.715 |
| 14.924100000000001 | 61.541 |
| 14.9321 | 61.368 |
| 14.9402 | 61.194 |
| 14.9482 | 60.994 |
| 14.956299999999999 | 60.772 |
| 14.9643 | 60.552 |
| 14.9724 | 60.331 |
| 14.9804 | 60.11 |
| 14.9885 | 59.898 |
| 14.9965 | 59.716 |
| 15.0046 | 59.535 |
| 15.0126 | 59.353 |
| 15.020700000000001 | 59.172 |
| 15.0287 | 58.992 |
| 15.0368 | 58.84 |
| 15.044799999999999 | 58.696 |
| 15.0529 | 58.553 |
| 15.0609 | 58.409 |
| 15.069 | 58.266 |
| 15.077 | 58.118 |
| 15.0851 | 57.963 |
| 15.0931 | 57.808 |
| 15.1012 | 57.654 |
| 15.109200000000001 | 57.499 |
| 15.117299999999998 | 57.345 |
| 15.1253 | 57.173 |
| 15.1334 | 57 |
| 15.141399999999999 | 56.826 |
| 15.1495 | 56.653 |
| 15.1575 | 56.48 |
| 15.1656 | 56.305 |
| 15.1736 | 56.126 |
| 15.181700000000001 | 55.948 |
| 15.1897 | 55.77 |
| 15.197799999999999 | 55.592 |
| 15.2058 | 55.414 |
| 15.213899999999999 | 55.239 |
| 15.2219 | 55.065 |
| 15.23 | 54.891 |
| 15.238 | 54.718 |
| 15.2461 | 54.544 |
| 15.254100000000001 | 54.375 |
| 15.2622 | 54.212 |
| 15.2702 | 54.049 |
| 15.2783 | 53.887 |
| 15.286299999999999 | 53.724 |
| 15.2944 | 53.562 |
| 15.3024 | 53.413 |
| 15.3105 | 53.268 |
| 15.3185 | 53.123 |
| 15.326600000000001 | 52.979 |
| 15.3346 | 52.834 |
| 15.3427 | 52.692 |
| 15.350700000000002 | 52.569 |
| 15.358799999999999 | 52.446 |
| 15.3668 | 52.323 |
| 15.3749 | 52.2 |
| 15.3829 | 52.077 |
| 15.391 | 51.965 |
| 15.399 | 51.864 |
| 15.4071 | 51.763 |
| 15.4151 | 51.663 |
| 15.423200000000001 | 51.562 |
| 15.4312 | 51.462 |
| 15.4393 | 51.377 |
| 15.447299999999998 | 51.296 |
| 15.4554 | 51.216 |
| 15.4634 | 51.136 |
| 15.4715 | 51.055 |
| 15.4795 | 50.976 |
| 15.4876 | 50.913 |
| 15.4956 | 50.849 |
| 15.5037 | 50.786 |
| 15.511700000000001 | 50.722 |
| 15.5198 | 50.659 |
| 15.5278 | 50.6 |
| 15.5359 | 50.551 |
| 15.543899999999999 | 50.503 |
| 15.552 | 50.454 |
| 15.56 | 50.406 |
| 15.568100000000001 | 50.358 |
| 15.5761 | 50.317 |
| 15.584200000000001 | 50.283 |
| 15.5922 | 50.25 |
| 15.600299999999999 | 50.216 |
| 15.6083 | 50.183 |
| 15.616299999999999 | 50.149 |
| 15.6244 | 50.125 |
| 15.6324 | 50.105 |
| 15.6405 | 50.084 |
| 15.6485 | 50.064 |
| 15.656600000000001 | 50.044 |
| 15.6646 | 50.024 |
| 15.6727 | 50.012 |
| 15.6807 | 50.002 |
| 15.688799999999999 | 49.992 |
| 15.6968 | 49.982 |
| 15.7049 | 49.972 |
| 15.7129 | 49.962 |
| 15.721 | 49.96 |
| 15.729 | 49.958 |
| 15.7371 | 49.956 |
| 15.7451 | 49.955 |
| 15.753200000000001 | 49.953 |
| 15.7612 | 49.951 |
| 15.7693 | 49.956 |
| 15.777299999999999 | 49.961 |
| 15.7854 | 49.966 |
| 15.7934 | 49.972 |
| 15.8015 | 49.977 |
| 15.8095 | 49.982 |
| 15.8176 | 49.992 |
| 15.8256 | 50.003 |
| 15.8337 | 50.013 |
| 15.841700000000001 | 50.024 |
| 15.8498 | 50.034 |
| 15.8578 | 50.044 |
| 15.8659 | 50.059 |
| 15.873899999999999 | 50.074 |
| 15.882 | 50.089 |
| 15.89 | 50.104 |
| 15.898100000000001 | 50.119 |
| 15.9061 | 50.134 |
| 15.914200000000001 | 50.153 |
| 15.9222 | 50.172 |
| 15.930299999999999 | 50.191 |
| 15.9383 | 50.21 |
| 15.946399999999999 | 50.23 |
| 15.9544 | 50.249 |
| 15.9625 | 50.271 |
| 15.9705 | 50.294 |
| 15.9786 | 50.317 |
| 15.986600000000001 | 50.34 |
| 15.9947 | 50.362 |
| 16.0027 | 50.385 |
| 16.0108 | 50.408 |
| 16.0188 | 50.43 |
| 16.0269 | 50.453 |
| 16.0349 | 50.476 |
| 16.043 | 50.498 |
| 16.051 | 50.521 |
| 16.0591 | 50.538 |
| 16.0671 | 50.554 |
| 16.075200000000002 | 50.568 |
| 16.0832 | 50.583 |
| 16.0913 | 50.598 |
| 16.0993 | 50.613 |
| 16.1074 | 50.623 |
| 16.1154 | 50.625 |
| 16.1235 | 50.627 |
| 16.1315 | 50.629 |
| 16.1396 | 50.631 |
| 16.1476 | 50.633 |
| 16.1557 | 50.632 |
| 16.163700000000002 | 50.62 |
| 16.171799999999998 | 50.608 |
| 16.1798 | 50.596 |
| 16.1879 | 50.584 |
| 16.195899999999998 | 50.572 |
| 16.204 | 50.56 |
| 16.212 | 50.534 |
| 16.2201 | 50.508 |
| 16.2281 | 50.481 |
| 16.2362 | 50.454 |
| 16.2442 | 50.427 |
| 16.252299999999998 | 50.4 |
| 16.2603 | 50.364 |
| 16.2684 | 50.322 |
| 16.2764 | 50.28 |
| 16.2845 | 50.238 |
| 16.2925 | 50.196 |
| 16.3006 | 50.154 |
| 16.308600000000002 | 50.109 |
| 16.3167 | 50.053 |
| 16.3247 | 49.997 |
| 16.3328 | 49.941 |
| 16.340799999999998 | 49.886 |
| 16.3489 | 49.83 |
| 16.3569 | 49.774 |
| 16.365 | 49.707 |
| 16.373 | 49.638 |
| 16.3811 | 49.569 |
| 16.3891 | 49.5 |
| 16.3972 | 49.432 |
| 16.4052 | 49.363 |
| 16.4133 | 49.288 |
| 16.4213 | 49.205 |
| 16.4294 | 49.122 |
| 16.4374 | 49.039 |
| 16.4455 | 48.956 |
| 16.4535 | 48.874 |
| 16.461599999999997 | 48.791 |
| 16.4696 | 48.692 |
| 16.477700000000002 | 48.592 |
| 16.4857 | 48.492 |
| 16.4938 | 48.392 |
| 16.5018 | 48.292 |
| 16.509900000000002 | 48.193 |
| 16.5179 | 48.082 |
| 16.526 | 47.96 |
| 16.534 | 47.838 |
| 16.542099999999998 | 47.716 |
| 16.550099999999997 | 47.594 |
| 16.5582 | 47.472 |
| 16.566200000000002 | 47.35 |
| 16.5743 | 47.2 |
| 16.5823 | 47.046 |
| 16.590400000000002 | 46.893 |
| 16.5984 | 46.74 |
| 16.6065 | 46.587 |
| 16.6145 | 46.434 |
| 16.6226 | 46.269 |
| 16.630599999999998 | 46.076 |
| 16.6387 | 45.883 |
| 16.6467 | 45.691 |
| 16.654799999999998 | 45.499 |
| 16.6628 | 45.306 |
| 16.670900000000003 | 45.114 |
| 16.678900000000002 | 44.898 |
| 16.687 | 44.67 |
| 16.695 | 44.442 |
| 16.7031 | 44.214 |
| 16.7111 | 43.986 |
| 16.7192 | 43.759 |
| 16.7272 | 43.532 |
| 16.7353 | 43.279 |
| 16.743299999999998 | 43.025 |
| 16.7514 | 42.772 |
| 16.759400000000003 | 42.519 |
| 16.7675 | 42.267 |
| 16.7755 | 42.014 |
| 16.7836 | 41.756 |
| 16.7916 | 41.482 |
| 16.7997 | 41.208 |
| 16.8077 | 40.934 |
| 16.8157 | 40.66 |
| 16.8238 | 40.386 |
| 16.831799999999998 | 40.113 |
| 16.8399 | 39.83 |
| 16.847900000000003 | 39.537 |
| 16.856 | 39.244 |
| 16.864 | 38.951 |
| 16.8721 | 38.659 |
| 16.8801 | 38.367 |
| 16.8882 | 38.075 |
| 16.8962 | 37.778 |
| 16.9043 | 37.48 |
| 16.9123 | 37.182 |
| 16.9204 | 36.883 |
| 16.9284 | 36.586 |
| 16.9365 | 36.288 |
| 16.9445 | 35.991 |
| 16.952599999999997 | 35.698 |
| 16.9606 | 35.408 |
| 16.968700000000002 | 35.117 |
| 16.9767 | 34.826 |
| 16.9848 | 34.536 |
| 16.9928 | 34.246 |
| 17.0009 | 33.957 |
| 17.0089 | 33.672 |
| 17.017 | 33.389 |
| 17.025 | 33.106 |
| 17.033099999999997 | 32.823 |
| 17.0411 | 32.54 |
| 17.0492 | 32.257 |
| 17.0572 | 31.975 |
| 17.0653 | 31.697 |
| 17.0733 | 31.42 |
| 17.081400000000002 | 31.142 |
| 17.0894 | 30.865 |
| 17.0975 | 30.588 |
| 17.1055 | 30.311 |
| 17.113599999999998 | 30.035 |
| 17.121599999999997 | 29.765 |
| 17.1297 | 29.495 |
| 17.137700000000002 | 29.226 |
| 17.145799999999998 | 28.957 |
| 17.1538 | 28.688 |
| 17.161900000000003 | 28.419 |
| 17.169900000000002 | 28.151 |
| 17.178 | 27.887 |
| 17.186 | 27.624 |
| 17.1941 | 27.361 |
| 17.202099999999998 | 27.098 |
| 17.2102 | 26.836 |
| 17.2182 | 26.574 |
| 17.2263 | 26.312 |
| 17.234299999999998 | 26.053 |
| 17.2424 | 25.794 |
| 17.250400000000003 | 25.536 |
| 17.2585 | 25.278 |
| 17.2665 | 25.02 |
| 17.2746 | 24.762 |
| 17.2826 | 24.505 |
| 17.2907 | 24.248 |
| 17.2987 | 23.992 |
| 17.3068 | 23.735 |
| 17.314799999999998 | 23.479 |
| 17.3229 | 23.224 |
| 17.3309 | 22.968 |
| 17.339 | 22.713 |
| 17.347 | 22.462 |
| 17.3551 | 22.215 |
| 17.3631 | 21.969 |
| 17.3712 | 21.722 |
| 17.3792 | 21.476 |
| 17.3873 | 21.23 |
| 17.3953 | 20.985 |
| 17.4034 | 20.747 |
| 17.4114 | 20.526 |
| 17.4195 | 20.305 |
| 17.4275 | 20.085 |
| 17.435599999999997 | 19.864 |
| 17.4436 | 19.644 |
| 17.451700000000002 | 19.425 |
| 17.4597 | 19.206 |
| 17.4678 | 19.014 |
| 17.4758 | 18.821 |
| 17.483900000000002 | 18.629 |
| 17.4919 | 18.438 |
| 17.5 | 18.246 |
| 17.508 | 18.054 |
| 17.516099999999998 | 17.863 |
| 17.524099999999997 | 17.689 |
| 17.5322 | 17.523 |
| 17.540200000000002 | 17.357 |
| 17.548299999999998 | 17.191 |
| 17.5563 | 17.025 |
| 17.564400000000003 | 16.86 |
| 17.572400000000002 | 16.694 |
| 17.5805 | 16.539 |
| 17.5885 | 16.405 |
| 17.5966 | 16.271 |
| 17.604599999999998 | 16.137 |
| 17.6127 | 16.003 |
| 17.6207 | 15.869 |
| 17.6288 | 15.736 |
| 17.6368 | 15.602 |
| 17.6449 | 15.499 |
| 17.652900000000002 | 15.4 |
| 17.661 | 15.301 |
| 17.669 | 15.201 |
| 17.6771 | 15.102 |
| 17.6851 | 15.003 |
| 17.6932 | 14.904 |
| 17.7012 | 14.816 |
| 17.7093 | 14.744 |
| 17.717299999999998 | 14.671 |
| 17.7254 | 14.599 |
| 17.733400000000003 | 14.526 |
| 17.7415 | 14.454 |
| 17.7495 | 14.382 |
| 17.7576 | 14.31 |
| 17.7656 | 14.255 |
| 17.7737 | 14.202 |
| 17.7817 | 14.149 |
| 17.7898 | 14.097 |
| 17.7978 | 14.044 |
| 17.8059 | 13.991 |
| 17.8139 | 13.939 |
| 17.822 | 13.892 |
| 17.83 | 13.859 |
| 17.838099999999997 | 13.826 |
| 17.8461 | 13.793 |
| 17.854200000000002 | 13.76 |
| 17.8622 | 13.727 |
| 17.8703 | 13.694 |
| 17.8783 | 13.662 |
| 17.886400000000002 | 13.642 |
| 17.8944 | 13.629 |
| 17.9025 | 13.617 |
| 17.9105 | 13.604 |
| 17.918599999999998 | 13.591 |
| 17.926599999999997 | 13.578 |
| 17.9347 | 13.566 |
| 17.942700000000002 | 13.553 |
| 17.9508 | 13.554 |
| 17.9588 | 13.555 |
| 17.966900000000003 | 13.556 |
| 17.9749 | 13.558 |
| 17.983 | 13.559 |
| 17.991 | 13.56 |
| 17.9991 | 13.561 |
| 18.007099999999998 | 13.563 |
| 18.015099999999997 | 13.568 |
| 18.0232 | 13.574 |
| 18.031200000000002 | 13.579 |
| 18.0393 | 13.584 |
| 18.0473 | 13.589 |
| 18.055400000000002 | 13.594 |
| 18.0634 | 13.6 |
| 18.0715 | 13.604 |
| 18.0795 | 13.606 |
| 18.0876 | 13.609 |
| 18.095599999999997 | 13.612 |
| 18.1037 | 13.615 |
| 18.1117 | 13.618 |
| 18.119799999999998 | 13.62 |
| 18.1278 | 13.623 |
| 18.135900000000003 | 13.622 |
| 18.143900000000002 | 13.618 |
| 18.152 | 13.614 |
| 18.16 | 13.61 |
| 18.1681 | 13.606 |
| 18.176099999999998 | 13.602 |
| 18.1842 | 13.599 |
| 18.1922 | 13.595 |
| 18.2003 | 13.582 |
| 18.208299999999998 | 13.566 |
| 18.2164 | 13.55 |
| 18.224400000000003 | 13.534 |
| 18.2325 | 13.518 |
| 18.2405 | 13.502 |
| 18.2486 | 13.486 |
| 18.2566 | 13.47 |
| 18.2647 | 13.444 |
| 18.2727 | 13.415 |
| 18.2808 | 13.385 |
| 18.2888 | 13.356 |
| 18.2969 | 13.326 |
| 18.3049 | 13.297 |
| 18.313 | 13.268 |
| 18.321 | 13.238 |
| 18.329099999999997 | 13.203 |
| 18.3371 | 13.164 |
| 18.345200000000002 | 13.126 |
| 18.3532 | 13.088 |
| 18.3613 | 13.05 |
| 18.3693 | 13.012 |
| 18.3774 | 12.974 |
| 18.3854 | 12.936 |
| 18.3935 | 12.896 |
| 18.4015 | 12.855 |
| 18.409599999999998 | 12.814 |
| 18.4176 | 12.773 |
| 18.4257 | 12.732 |
| 18.4337 | 12.692 |
| 18.4418 | 12.651 |
| 18.4498 | 12.61 |
| 18.457900000000002 | 12.57 |
| 18.4659 | 12.529 |
| 18.474 | 12.489 |
| 18.482 | 12.449 |
| 18.490099999999998 | 12.409 |
| 18.498099999999997 | 12.369 |
| 18.5062 | 12.328 |
| 18.514200000000002 | 12.288 |
| 18.522299999999998 | 12.248 |
| 18.5303 | 12.207 |
| 18.538400000000003 | 12.165 |
| 18.546400000000002 | 12.124 |
| 18.5545 | 12.083 |
| 18.5625 | 12.042 |
| 18.5706 | 12.001 |
| 18.578599999999998 | 11.96 |
| 18.5867 | 11.918 |
| 18.5947 | 11.872 |
| 18.6028 | 11.825 |
| 18.610799999999998 | 11.778 |
| 18.6189 | 11.732 |
| 18.626900000000003 | 11.685 |
| 18.635 | 11.639 |
| 18.643 | 11.593 |
| 18.6511 | 11.546 |
| 18.6591 | 11.496 |
| 18.6672 | 11.445 |
| 18.6752 | 11.394 |
| 18.6833 | 11.343 |
| 18.6913 | 11.292 |
| 18.6994 | 11.241 |
| 18.7074 | 11.19 |
| 18.7155 | 11.14 |
| 18.7235 | 11.09 |
| 18.7316 | 11.042 |
| 18.7396 | 10.994 |
| 18.747700000000002 | 10.946 |
| 18.7557 | 10.898 |
| 18.7638 | 10.85 |
| 18.7718 | 10.802 |
| 18.7799 | 10.754 |
| 18.7879 | 10.707 |
| 18.796 | 10.666 |
| 18.804 | 10.626 |
| 18.812099999999997 | 10.586 |
| 18.8201 | 10.546 |
| 18.828200000000002 | 10.506 |
| 18.8362 | 10.465 |
| 18.8443 | 10.425 |
| 18.8523 | 10.385 |
| 18.860400000000002 | 10.348 |
| 18.8684 | 10.314 |
| 18.8765 | 10.28 |
| 18.8845 | 10.246 |
| 18.892599999999998 | 10.212 |
| 18.900599999999997 | 10.178 |
| 18.9087 | 10.144 |
| 18.916700000000002 | 10.11 |
| 18.924799999999998 | 10.076 |
| 18.9328 | 10.045 |
| 18.940900000000003 | 10.015 |
| 18.948900000000002 | 9.984 |
| 18.957 | 9.954 |
| 18.965 | 9.924 |
| 18.9731 | 9.894 |
| 18.981099999999998 | 9.863 |
| 18.9892 | 9.833 |
| 18.9972 | 9.805 |
| 19.0053 | 9.78 |
| 19.0133 | 9.756 |
| 19.0214 | 9.731 |
| 19.029400000000003 | 9.706 |
| 19.0375 | 9.681 |
| 19.0455 | 9.657 |
| 19.0536 | 9.632 |
| 19.0616 | 9.608 |
| 19.0697 | 9.588 |
| 19.0777 | 9.571 |
| 19.0858 | 9.554 |
| 19.093799999999998 | 9.537 |
| 19.1019 | 9.52 |
| 19.109900000000003 | 9.503 |
| 19.118 | 9.486 |
| 19.126 | 9.469 |
| 19.1341 | 9.452 |
| 19.1421 | 9.442 |
| 19.1502 | 9.432 |
| 19.1582 | 9.423 |
| 19.1663 | 9.413 |
| 19.1743 | 9.403 |
| 19.1824 | 9.393 |
| 19.1904 | 9.384 |
| 19.1985 | 9.374 |
| 19.2065 | 9.365 |
| 19.2145 | 9.362 |
| 19.2226 | 9.359 |
| 19.2306 | 9.356 |
| 19.2387 | 9.353 |
| 19.2467 | 9.35 |
| 19.2548 | 9.347 |
| 19.2628 | 9.344 |
| 19.2709 | 9.341 |
| 19.2789 | 9.34 |
| 19.287 | 9.343 |
| 19.295 | 9.346 |
| 19.303099999999997 | 9.349 |
| 19.3111 | 9.352 |
| 19.319200000000002 | 9.355 |
| 19.3272 | 9.358 |
| 19.3353 | 9.361 |
| 19.3433 | 9.364 |
| 19.3514 | 9.368 |
| 19.3594 | 9.375 |
| 19.3675 | 9.382 |
| 19.3755 | 9.388 |
| 19.383599999999998 | 9.395 |
| 19.391599999999997 | 9.402 |
| 19.3997 | 9.409 |
| 19.407700000000002 | 9.416 |
| 19.4158 | 9.423 |
| 19.4238 | 9.43 |
| 19.431900000000002 | 9.438 |
| 19.4399 | 9.447 |
| 19.448 | 9.456 |
| 19.456 | 9.464 |
| 19.4641 | 9.472 |
| 19.472099999999998 | 9.481 |
| 19.4802 | 9.489 |
| 19.4882 | 9.498 |
| 19.496299999999998 | 9.506 |
| 19.5043 | 9.515 |
| 19.512400000000003 | 9.523 |
| 19.520400000000002 | 9.532 |
| 19.5285 | 9.54 |
| 19.5365 | 9.549 |
| 19.5446 | 9.557 |
| 19.552599999999998 | 9.565 |
| 19.5607 | 9.574 |
| 19.5687 | 9.582 |
| 19.5768 | 9.59 |
| 19.584799999999998 | 9.598 |
| 19.5929 | 9.606 |
| 19.600900000000003 | 9.614 |
| 19.609 | 9.622 |
| 19.617 | 9.63 |
| 19.6251 | 9.637 |
| 19.6331 | 9.645 |
| 19.6412 | 9.653 |
| 19.6492 | 9.661 |
| 19.6573 | 9.668 |
| 19.6653 | 9.676 |
| 19.6734 | 9.684 |
| 19.6814 | 9.691 |
| 19.6895 | 9.699 |
| 19.6975 | 9.706 |
| 19.705599999999997 | 9.714 |
| 19.7136 | 9.721 |
| 19.721700000000002 | 9.728 |
| 19.7297 | 9.734 |
| 19.7378 | 9.739 |
| 19.7458 | 9.745 |
| 19.7539 | 9.751 |
| 19.7619 | 9.756 |
| 19.77 | 9.762 |
| 19.778 | 9.768 |
| 19.786099999999998 | 9.774 |
| 19.7941 | 9.779 |
| 19.8022 | 9.784 |
| 19.810200000000002 | 9.789 |
| 19.8183 | 9.794 |
| 19.8263 | 9.799 |
| 19.834400000000002 | 9.804 |
| 19.8424 | 9.809 |
| 19.8505 | 9.814 |
| 19.8585 | 9.818 |
| 19.8666 | 9.823 |
| 19.874599999999997 | 9.834 |
| 19.8827 | 9.846 |
| 19.890700000000002 | 9.858 |
| 19.898799999999998 | 9.87 |
| 19.9068 | 9.882 |
| 19.914900000000003 | 9.894 |
| 19.922900000000002 | 9.906 |
| 19.931 | 9.918 |
| 19.939 | 9.93 |
| 19.9471 | 9.945 |
| 19.955099999999998 | 9.967 |
| 19.9632 | 9.989 |
| 19.9712 | 10.011 |
| 19.9793 | 10.033 |
| 19.987299999999998 | 10.055 |
| 19.9954 | 10.077 |
| 20.003400000000003 | 10.099 |
| 20.0115 | 10.12 |
| 20.0195 | 10.142 |
| 20.0276 | 10.166 |
| 20.0356 | 10.191 |
| 20.0437 | 10.215 |
| 20.0517 | 10.24 |
| 20.0598 | 10.264 |
| 20.0678 | 10.289 |
| 20.0759 | 10.313 |
| 20.0839 | 10.338 |
| 20.092 | 10.362 |
| 20.1 | 10.386 |
| 20.1081 | 10.405 |
| 20.1161 | 10.424 |
| 20.124200000000002 | 10.444 |
| 20.1322 | 10.463 |
| 20.1403 | 10.483 |
| 20.1483 | 10.502 |
| 20.1564 | 10.522 |
| 20.1644 | 10.541 |
| 20.1725 | 10.56 |
| 20.1805 | 10.576 |
| 20.188599999999997 | 10.587 |
| 20.1966 | 10.597 |
| 20.2047 | 10.608 |
| 20.2127 | 10.619 |
| 20.2208 | 10.63 |
| 20.2288 | 10.64 |
| 20.236900000000002 | 10.651 |
| 20.2449 | 10.662 |
| 20.253 | 10.673 |
| 20.261 | 10.678 |
| 20.269099999999998 | 10.679 |
| 20.277099999999997 | 10.681 |
| 20.2852 | 10.682 |
| 20.293200000000002 | 10.684 |
| 20.301299999999998 | 10.686 |
| 20.3093 | 10.688 |
| 20.317400000000003 | 10.689 |
| 20.325400000000002 | 10.691 |
| 20.3335 | 10.692 |
| 20.3415 | 10.688 |
| 20.3496 | 10.683 |
| 20.357599999999998 | 10.678 |
| 20.3657 | 10.673 |
| 20.3737 | 10.667 |
| 20.3818 | 10.662 |
| 20.3898 | 10.657 |
| 20.3979 | 10.652 |
| 20.405900000000003 | 10.646 |
| 20.4139 | 10.641 |
| 20.422 | 10.631 |
| 20.43 | 10.62 |
| 20.4381 | 10.61 |
| 20.446099999999998 | 10.599 |
| 20.4542 | 10.588 |
| 20.4622 | 10.578 |
| 20.470299999999998 | 10.567 |
| 20.4783 | 10.557 |
| 20.4864 | 10.546 |
| 20.494400000000002 | 10.535 |
| 20.5025 | 10.518 |
| 20.5105 | 10.5 |
| 20.5186 | 10.481 |
| 20.5266 | 10.463 |
| 20.5347 | 10.444 |
| 20.5427 | 10.426 |
| 20.5508 | 10.407 |
| 20.558799999999998 | 10.389 |
| 20.5669 | 10.371 |
| 20.574900000000003 | 10.352 |
| 20.583 | 10.324 |
| 20.591 | 10.292 |
| 20.5991 | 10.26 |
| 20.6071 | 10.227 |
| 20.6152 | 10.195 |
| 20.6232 | 10.163 |
| 20.6313 | 10.131 |
| 20.6393 | 10.099 |
| 20.6474 | 10.067 |
| 20.6554 | 10.035 |
| 20.6635 | 9.996 |
| 20.6715 | 9.95 |
| 20.679599999999997 | 9.904 |
| 20.6876 | 9.858 |
| 20.695700000000002 | 9.812 |
| 20.7037 | 9.766 |
| 20.7118 | 9.72 |
| 20.7198 | 9.674 |
| 20.7279 | 9.629 |
| 20.7359 | 9.583 |
| 20.744 | 9.536 |
| 20.752 | 9.485 |
| 20.760099999999998 | 9.433 |
| 20.768099999999997 | 9.382 |
| 20.7762 | 9.331 |
| 20.784200000000002 | 9.28 |
| 20.7923 | 9.228 |
| 20.8003 | 9.177 |
| 20.808400000000002 | 9.126 |
| 20.8164 | 9.075 |
| 20.8245 | 9.024 |
| 20.8325 | 8.976 |
| 20.8406 | 8.928 |
| 20.848599999999998 | 8.879 |
| 20.8567 | 8.831 |
| 20.8647 | 8.783 |
| 20.872799999999998 | 8.735 |
| 20.8808 | 8.687 |
| 20.888900000000003 | 8.639 |
| 20.896900000000002 | 8.591 |
| 20.905 | 8.543 |
| 20.913 | 8.498 |
| 20.9211 | 8.457 |
| 20.9291 | 8.415 |
| 20.9372 | 8.374 |
| 20.9452 | 8.333 |
| 20.9533 | 8.292 |
| 20.961299999999998 | 8.251 |
| 20.9694 | 8.209 |
| 20.977400000000003 | 8.168 |
| 20.9855 | 8.127 |
| 20.9935 | 8.086 |
| 21.0016 | 8.052 |
| 21.0096 | 8.018 |
| 21.0177 | 7.984 |
| 21.0257 | 7.951 |
| 21.0338 | 7.917 |
| 21.0418 | 7.883 |
| 21.0499 | 7.849 |
| 21.0579 | 7.816 |
| 21.066 | 7.782 |
| 21.074 | 7.748 |
| 21.082099999999997 | 7.716 |
| 21.0901 | 7.685 |
| 21.098200000000002 | 7.655 |
| 21.1062 | 7.624 |
| 21.1143 | 7.594 |
| 21.1223 | 7.563 |
| 21.1304 | 7.533 |
| 21.1384 | 7.502 |
| 21.1465 | 7.472 |
| 21.1545 | 7.441 |
| 21.162599999999998 | 7.411 |
| 21.1706 | 7.381 |
| 21.1787 | 7.351 |
| 21.186700000000002 | 7.321 |
| 21.1948 | 7.29 |
| 21.2028 | 7.26 |
| 21.210900000000002 | 7.23 |
| 21.2189 | 7.2 |
| 21.227 | 7.17 |
| 21.235 | 7.14 |
| 21.2431 | 7.11 |
| 21.251099999999997 | 7.08 |
| 21.2592 | 7.049 |
| 21.2672 | 7.017 |
| 21.275299999999998 | 6.986 |
| 21.2833 | 6.954 |
| 21.291400000000003 | 6.923 |
| 21.299400000000002 | 6.891 |
| 21.3075 | 6.86 |
| 21.3155 | 6.828 |
| 21.3236 | 6.797 |
| 21.331599999999998 | 6.765 |
| 21.3397 | 6.734 |
| 21.3477 | 6.695 |
| 21.3558 | 6.657 |
| 21.363799999999998 | 6.619 |
| 21.3719 | 6.58 |
| 21.379900000000003 | 6.542 |
| 21.388 | 6.504 |
| 21.396 | 6.465 |
| 21.4041 | 6.427 |
| 21.4121 | 6.389 |
| 21.4202 | 6.351 |
| 21.4282 | 6.312 |
| 21.4363 | 6.262 |
| 21.4443 | 6.211 |
| 21.4524 | 6.161 |
| 21.4604 | 6.111 |
| 21.4685 | 6.061 |
| 21.4765 | 6.011 |
| 21.484599999999997 | 5.961 |
| 21.4926 | 5.911 |
| 21.500700000000002 | 5.861 |
| 21.5087 | 5.811 |
| 21.5168 | 5.761 |
| 21.5248 | 5.702 |
| 21.5329 | 5.644 |
| 21.5409 | 5.586 |
| 21.549 | 5.528 |
| 21.557 | 5.47 |
| 21.565099999999997 | 5.412 |
| 21.5731 | 5.353 |
| 21.5812 | 5.295 |
| 21.5892 | 5.238 |
| 21.5973 | 5.18 |
| 21.6053 | 5.122 |
| 21.6133 | 5.068 |
| 21.6214 | 5.014 |
| 21.6294 | 4.96 |
| 21.6375 | 4.906 |
| 21.6455 | 4.853 |
| 21.653599999999997 | 4.799 |
| 21.6616 | 4.746 |
| 21.669700000000002 | 4.692 |
| 21.6777 | 4.639 |
| 21.6858 | 4.586 |
| 21.6938 | 4.532 |
| 21.701900000000002 | 4.49 |
| 21.7099 | 4.454 |
| 21.718 | 4.417 |
| 21.726 | 4.381 |
| 21.734099999999998 | 4.345 |
| 21.742099999999997 | 4.308 |
| 21.7502 | 4.272 |
| 21.758200000000002 | 4.236 |
| 21.766299999999998 | 4.2 |
| 21.7743 | 4.164 |
| 21.782400000000003 | 4.127 |
| 21.7904 | 4.098 |
| 21.7985 | 4.08 |
| 21.8065 | 4.063 |
| 21.8146 | 4.045 |
| 21.822599999999998 | 4.028 |
| 21.8307 | 4.011 |
| 21.8387 | 3.993 |
| 21.846799999999998 | 3.976 |
| 21.8548 | 3.958 |
| 21.8629 | 3.941 |
| 21.870900000000002 | 3.924 |
| 21.879 | 3.906 |
| 21.887 | 3.894 |
| 21.8951 | 3.881 |
| 21.9031 | 3.869 |
| 21.9112 | 3.857 |
| 21.9192 | 3.845 |
| 21.9273 | 3.833 |
| 21.935299999999998 | 3.82 |
| 21.9434 | 3.808 |
| 21.951400000000003 | 3.796 |
| 21.9595 | 3.784 |
| 21.9675 | 3.772 |
| 21.9756 | 3.756 |
| 21.9836 | 3.736 |
| 21.9917 | 3.715 |
| 21.9997 | 3.694 |
| 22.0078 | 3.674 |
| 22.0158 | 3.653 |
| 22.0239 | 3.633 |
| 22.0319 | 3.612 |
| 22.04 | 3.591 |
| 22.048 | 3.571 |
| 22.056099999999997 | 3.55 |
| 22.0641 | 3.53 |
| 22.072200000000002 | 3.502 |
| 22.0802 | 3.473 |
| 22.0883 | 3.444 |
| 22.0963 | 3.415 |
| 22.104400000000002 | 3.385 |
| 22.1124 | 3.356 |
| 22.1205 | 3.327 |
| 22.1285 | 3.298 |
| 22.136599999999998 | 3.269 |
| 22.144599999999997 | 3.24 |
| 22.1527 | 3.211 |
| 22.160700000000002 | 3.181 |
| 22.1688 | 3.151 |
| 22.1768 | 3.121 |
| 22.184900000000003 | 3.091 |
| 22.1929 | 3.061 |
| 22.201 | 3.031 |
| 22.209 | 3.001 |
| 22.2171 | 2.971 |
| 22.225099999999998 | 2.941 |
| 22.2332 | 2.911 |
| 22.2412 | 2.881 |
| 22.249299999999998 | 2.851 |
| 22.2573 | 2.823 |
| 22.265400000000003 | 2.798 |
| 22.273400000000002 | 2.773 |
| 22.2815 | 2.749 |
| 22.2895 | 2.724 |
| 22.2976 | 2.699 |
| 22.3056 | 2.675 |
| 22.3137 | 2.65 |
| 22.3217 | 2.626 |
| 22.3298 | 2.601 |
| 22.337799999999998 | 2.577 |
| 22.3459 | 2.552 |
| 22.353900000000003 | 2.53 |
| 22.362 | 2.51 |
| 22.37 | 2.491 |
| 22.3781 | 2.472 |
| 22.3861 | 2.453 |
| 22.3942 | 2.433 |
| 22.4022 | 2.414 |
| 22.4103 | 2.395 |
| 22.4183 | 2.376 |
| 22.4264 | 2.356 |
| 22.4344 | 2.337 |
| 22.4425 | 2.318 |
| 22.4505 | 2.3 |
| 22.458599999999997 | 2.283 |
| 22.4666 | 2.266 |
| 22.474700000000002 | 2.249 |
| 22.4827 | 2.232 |
| 22.4908 | 2.215 |
| 22.4988 | 2.198 |
| 22.5069 | 2.181 |
| 22.5149 | 2.164 |
| 22.523 | 2.147 |
| 22.531 | 2.13 |
| 22.539099999999998 | 2.113 |
| 22.547099999999997 | 2.097 |
| 22.5552 | 2.081 |
| 22.563200000000002 | 2.066 |
| 22.5713 | 2.051 |
| 22.5793 | 2.036 |
| 22.587400000000002 | 2.02 |
| 22.5954 | 2.005 |
| 22.6035 | 1.99 |
| 22.6115 | 1.975 |
| 22.6196 | 1.959 |
| 22.627599999999997 | 1.944 |
| 22.6357 | 1.929 |
| 22.6437 | 1.914 |
| 22.651799999999998 | 1.902 |
| 22.6598 | 1.89 |
| 22.667900000000003 | 1.878 |
| 22.675900000000002 | 1.867 |
| 22.684 | 1.855 |
| 22.692 | 1.843 |
| 22.7001 | 1.831 |
| 22.708099999999998 | 1.82 |
| 22.7162 | 1.808 |
| 22.7242 | 1.796 |
| 22.7323 | 1.784 |
| 22.740299999999998 | 1.773 |
| 22.7484 | 1.762 |
| 22.756400000000003 | 1.753 |
| 22.7645 | 1.744 |
| 22.7725 | 1.735 |
| 22.7806 | 1.726 |
| 22.7886 | 1.716 |
| 22.7967 | 1.707 |
| 22.8047 | 1.698 |
| 22.8127 | 1.689 |
| 22.8208 | 1.68 |
| 22.828799999999998 | 1.671 |
| 22.8369 | 1.661 |
| 22.844900000000003 | 1.652 |
| 22.853 | 1.643 |
| 22.861 | 1.634 |
| 22.8691 | 1.625 |
| 22.8771 | 1.616 |
| 22.8852 | 1.606 |
| 22.8932 | 1.597 |
| 22.9013 | 1.588 |
| 22.909299999999998 | 1.579 |
| 22.9174 | 1.57 |
| 22.9254 | 1.561 |
| 22.9335 | 1.552 |
| 22.9415 | 1.542 |
| 22.9496 | 1.532 |
| 22.9576 | 1.521 |
| 22.965700000000002 | 1.511 |
| 22.9737 | 1.5 |
| 22.9818 | 1.489 |
| 22.9898 | 1.479 |
| 22.9979 | 1.468 |
| 23.0059 | 1.457 |
| 23.014 | 1.446 |
| 23.022 | 1.436 |
| 23.030099999999997 | 1.425 |
| 23.0381 | 1.414 |
| 23.046200000000002 | 1.404 |
| 23.0542 | 1.39 |
| 23.0623 | 1.376 |
| 23.0703 | 1.362 |
| 23.078400000000002 | 1.348 |
| 23.0864 | 1.334 |
| 23.0945 | 1.32 |
| 23.1025 | 1.306 |
| 23.110599999999998 | 1.292 |
| 23.118599999999997 | 1.278 |
| 23.1267 | 1.265 |
| 23.134700000000002 | 1.251 |
| 23.142799999999998 | 1.237 |
| 23.1508 | 1.222 |
| 23.158900000000003 | 1.204 |
| 23.166900000000002 | 1.186 |
| 23.175 | 1.167 |
| 23.183 | 1.149 |
| 23.1911 | 1.13 |
| 23.199099999999998 | 1.112 |
| 23.2072 | 1.094 |
| 23.2152 | 1.075 |
| 23.2233 | 1.057 |
| 23.2313 | 1.039 |
| 23.2394 | 1.021 |
| 23.247400000000003 | 1.002 |
| 23.2555 | 0.983 |
| 23.2635 | 0.961 |
| 23.2716 | 0.939 |
| 23.2796 | 0.918 |
| 23.2877 | 0.896 |
| 23.2957 | 0.874 |
| 23.3038 | 0.852 |
| 23.311799999999998 | 0.831 |
| 23.3199 | 0.809 |
| 23.327900000000003 | 0.787 |
| 23.336 | 0.765 |
| 23.344 | 0.744 |
| 23.3521 | 0.722 |
| 23.3601 | 0.701 |
| 23.3682 | 0.681 |
| 23.3762 | 0.662 |
| 23.3843 | 0.642 |
| 23.3923 | 0.622 |
| 23.4004 | 0.603 |
| 23.4084 | 0.583 |
| 23.4165 | 0.564 |
| 23.4245 | 0.544 |
| 23.432599999999997 | 0.525 |
| 23.4406 | 0.505 |
| 23.448700000000002 | 0.486 |
| 23.4567 | 0.466 |
| 23.4648 | 0.448 |
| 23.4728 | 0.44 |
| 23.480900000000002 | 0.432 |
| 23.4889 | 0.424 |
| 23.497 | 0.415 |
| 23.505 | 0.407 |
| 23.513099999999998 | 0.399 |
| 23.521099999999997 | 0.391 |
| 23.5292 | 0.382 |
| 23.537200000000002 | 0.374 |
| 23.5453 | 0.366 |
| 23.5533 | 0.358 |
| 23.561400000000003 | 0.35 |
| 23.5694 | 0.341 |
| 23.5775 | 0.345 |
| 23.5855 | 0.35 |
| 23.5936 | 0.356 |
| 23.601599999999998 | 0.361 |
| 23.6097 | 0.366 |
| 23.6177 | 0.372 |
| 23.625799999999998 | 0.377 |
| 23.6338 | 0.382 |
| 23.6419 | 0.387 |
| 23.649900000000002 | 0.393 |
| 23.658 | 0.398 |
| 23.666 | 0.403 |
| 23.6741 | 0.408 |
| 23.6821 | 0.416 |
| 23.6902 | 0.427 |
| 23.6982 | 0.437 |
| 23.7063 | 0.447 |
| 23.714299999999998 | 0.458 |
| 23.7224 | 0.468 |
| 23.730400000000003 | 0.478 |
| 23.7385 | 0.489 |
| 23.7465 | 0.499 |
| 23.7546 | 0.509 |
| 23.7626 | 0.519 |
| 23.7707 | 0.53 |
| 23.7787 | 0.54 |
| 23.7868 | 0.55 |
| 23.7948 | 0.558 |
| 23.8029 | 0.567 |
| 23.8109 | 0.575 |
| 23.819 | 0.583 |
| 23.827 | 0.592 |
| 23.835099999999997 | 0.6 |
| 23.8431 | 0.608 |
| 23.851200000000002 | 0.616 |
| 23.8592 | 0.625 |
| 23.8673 | 0.633 |
| 23.8753 | 0.641 |
| 23.8834 | 0.65 |
| 23.8914 | 0.658 |
| 23.8995 | 0.666 |
| 23.9075 | 0.676 |
| 23.915599999999998 | 0.685 |
| 23.923599999999997 | 0.695 |
| 23.9317 | 0.704 |
| 23.939700000000002 | 0.713 |
| 23.9478 | 0.723 |
| 23.9558 | 0.732 |
| 23.963900000000002 | 0.742 |
| 23.9719 | 0.751 |
| 23.98 | 0.76 |
| 23.988 | 0.77 |
| 23.9961 | 0.779 |
| 24.004099999999998 | 0.788 |
| 24.0121 | 0.801 |
| 24.0202 | 0.816 |
| 24.028200000000002 | 0.831 |
| 24.0363 | 0.845 |
| 24.0443 | 0.86 |
| 24.052400000000002 | 0.875 |
| 24.0604 | 0.889 |
| 24.0685 | 0.904 |
| 24.0765 | 0.918 |
| 24.0846 | 0.933 |
| 24.092599999999997 | 0.948 |
| 24.1007 | 0.962 |
| 24.108700000000002 | 0.977 |
| 24.116799999999998 | 0.991 |
| 24.1248 | 1.012 |
| 24.132900000000003 | 1.035 |
| 24.140900000000002 | 1.058 |
| 24.149 | 1.081 |
| 24.157 | 1.104 |
| 24.1651 | 1.126 |
| 24.173099999999998 | 1.149 |
| 24.1812 | 1.172 |
| 24.1892 | 1.194 |
| 24.1973 | 1.217 |
| 24.205299999999998 | 1.24 |
| 24.2134 | 1.262 |
| 24.221400000000003 | 1.285 |
| 24.2295 | 1.308 |
| 24.2375 | 1.336 |
| 24.2456 | 1.367 |
| 24.2536 | 1.397 |
| 24.2617 | 1.427 |
| 24.2697 | 1.457 |
| 24.2778 | 1.487 |
| 24.2858 | 1.518 |
| 24.2939 | 1.548 |
| 24.3019 | 1.578 |
| 24.31 | 1.608 |
| 24.318 | 1.638 |
| 24.3261 | 1.668 |
| 24.3341 | 1.698 |
| 24.342200000000002 | 1.728 |
| 24.3502 | 1.757 |
| 24.3583 | 1.786 |
| 24.3663 | 1.815 |
| 24.3744 | 1.844 |
| 24.3824 | 1.873 |
| 24.3905 | 1.902 |
| 24.3985 | 1.931 |
| 24.406599999999997 | 1.959 |
| 24.4146 | 1.988 |
| 24.4227 | 2.017 |
| 24.4307 | 2.046 |
| 24.4388 | 2.074 |
| 24.4468 | 2.103 |
| 24.454900000000002 | 2.132 |
| 24.4629 | 2.155 |
| 24.471 | 2.171 |
| 24.479 | 2.186 |
| 24.487099999999998 | 2.202 |
| 24.495099999999997 | 2.217 |
| 24.5032 | 2.233 |
| 24.511200000000002 | 2.249 |
| 24.519299999999998 | 2.264 |
| 24.5273 | 2.28 |
| 24.535400000000003 | 2.295 |
| 24.543400000000002 | 2.311 |
| 24.5515 | 2.326 |
| 24.5595 | 2.342 |
| 24.5676 | 2.357 |
| 24.575599999999998 | 2.373 |
| 24.5837 | 2.37 |
| 24.5917 | 2.367 |
| 24.5998 | 2.364 |
| 24.6078 | 2.361 |
| 24.6159 | 2.359 |
| 24.623900000000003 | 2.356 |
| 24.632 | 2.353 |
| 24.64 | 2.35 |
| 24.6481 | 2.347 |
| 24.6561 | 2.345 |
| 24.6642 | 2.342 |
| 24.6722 | 2.339 |
| 24.6803 | 2.336 |
| 24.688299999999998 | 2.333 |
| 24.6964 | 2.325 |
| 24.7044 | 2.309 |
| 24.7125 | 2.293 |
| 24.7205 | 2.278 |
| 24.7286 | 2.262 |
| 24.7366 | 2.246 |
| 24.7447 | 2.231 |
| 24.7527 | 2.215 |
| 24.7608 | 2.2 |
| 24.7688 | 2.184 |
| 24.7769 | 2.168 |
| 24.7849 | 2.153 |
| 24.793 | 2.137 |
| 24.801 | 2.122 |
| 24.809099999999997 | 2.106 |
| 24.8171 | 2.086 |
| 24.825200000000002 | 2.065 |
| 24.8332 | 2.044 |
| 24.8413 | 2.022 |
| 24.8493 | 2.001 |
| 24.857400000000002 | 1.98 |
| 24.8654 | 1.959 |
| 24.8735 | 1.938 |
| 24.8815 | 1.916 |
| 24.889599999999998 | 1.895 |
| 24.897599999999997 | 1.874 |
| 24.9057 | 1.853 |
| 24.913700000000002 | 1.832 |
| 24.921799999999998 | 1.811 |
| 24.9298 | 1.79 |
| 24.937900000000003 | 1.763 |
| 24.9459 | 1.736 |
| 24.954 | 1.709 |
| 24.962 | 1.683 |
| 24.9701 | 1.656 |
| 24.978099999999998 | 1.629 |
| 24.9862 | 1.602 |
| 24.9942 | 1.576 |
| 25.002299999999998 | 1.549 |
| 25.0103 | 1.522 |
| 25.0184 | 1.495 |
| 25.026400000000002 | 1.469 |
| 25.0345 | 1.442 |
| 25.0425 | 1.415 |
| 25.0506 | 1.389 |